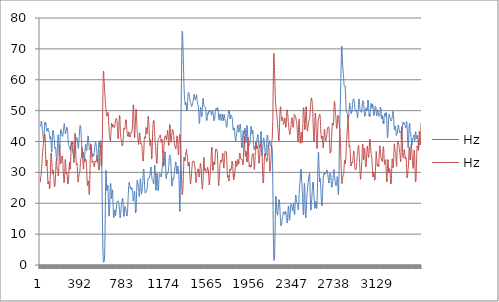
| Category | Hz |
|---|---|
| 0 | 26.726 |
| 1 | 26.86 |
| 2 | 26.973 |
| 3 | 27.096 |
| 4 | 27.419 |
| 5 | 28.13 |
| 6 | 28.596 |
| 7 | 28.884 |
| 8 | 28.81 |
| 9 | 28.945 |
| 10 | 29.17 |
| 11 | 29.409 |
| 12 | 29.923 |
| 13 | 30.649 |
| 14 | 31.294 |
| 15 | 31.779 |
| 16 | 32.388 |
| 17 | 32.934 |
| 18 | 33.452 |
| 19 | 34.033 |
| 20 | 34.539 |
| 21 | 35.131 |
| 22 | 35.586 |
| 23 | 35.89 |
| 24 | 36.439 |
| 25 | 36.863 |
| 26 | 37.154 |
| 27 | 37.618 |
| 28 | 38.208 |
| 29 | 38.745 |
| 30 | 39.246 |
| 31 | 39.546 |
| 32 | 39.827 |
| 33 | 40.127 |
| 34 | 40.131 |
| 35 | 40.396 |
| 36 | 40.659 |
| 37 | 40.978 |
| 38 | 41.489 |
| 39 | 41.693 |
| 40 | 41.989 |
| 41 | 42.309 |
| 42 | 42.433 |
| 43 | 42.374 |
| 44 | 42.374 |
| 45 | 41.998 |
| 46 | 41.648 |
| 47 | 40.816 |
| 48 | 39.41 |
| 49 | 38.141 |
| 50 | 36.687 |
| 51 | 35.324 |
| 52 | 34.186 |
| 53 | 33.439 |
| 54 | 32.881 |
| 55 | 32.45 |
| 56 | 32.124 |
| 57 | 32.035 |
| 58 | 32.374 |
| 59 | 32.67 |
| 60 | 33.204 |
| 61 | 33.623 |
| 62 | 34.053 |
| 63 | 33.773 |
| 64 | 33.114 |
| 65 | 32.573 |
| 66 | 31.843 |
| 67 | 31.12 |
| 68 | 30.223 |
| 69 | 29.652 |
| 70 | 28.812 |
| 71 | 27.872 |
| 72 | 26.683 |
| 73 | 26.303 |
| 74 | 26.542 |
| 75 | 26.656 |
| 76 | 26.778 |
| 77 | 26.931 |
| 78 | 27.144 |
| 79 | 26.948 |
| 80 | 26.988 |
| 81 | 27.107 |
| 82 | 27.435 |
| 83 | 27.185 |
| 84 | 26.3 |
| 85 | 25.553 |
| 86 | 25.038 |
| 87 | 24.706 |
| 88 | 24.585 |
| 89 | 24.774 |
| 90 | 25.021 |
| 91 | 25.634 |
| 92 | 26.244 |
| 93 | 27.337 |
| 94 | 28.798 |
| 95 | 30.245 |
| 96 | 31.531 |
| 97 | 32.603 |
| 98 | 33.458 |
| 99 | 34.274 |
| 100 | 35.116 |
| 101 | 35.774 |
| 102 | 36.233 |
| 103 | 36.265 |
| 104 | 36.003 |
| 105 | 35.39 |
| 106 | 34.74 |
| 107 | 34.113 |
| 108 | 33.656 |
| 109 | 33.146 |
| 110 | 32.312 |
| 111 | 31.125 |
| 112 | 30.136 |
| 113 | 29.552 |
| 114 | 29.35 |
| 115 | 29.716 |
| 116 | 30.046 |
| 117 | 30.265 |
| 118 | 30.3 |
| 119 | 30.207 |
| 120 | 30.302 |
| 121 | 30.759 |
| 122 | 31.043 |
| 123 | 30.764 |
| 124 | 30.25 |
| 125 | 29.393 |
| 126 | 28.677 |
| 127 | 28.101 |
| 128 | 27.506 |
| 129 | 27.049 |
| 130 | 26.568 |
| 131 | 25.835 |
| 132 | 25.325 |
| 133 | 25.215 |
| 134 | 25.113 |
| 135 | 25.087 |
| 136 | 25.152 |
| 137 | 25.287 |
| 138 | 25.667 |
| 139 | 26.186 |
| 140 | 26.782 |
| 141 | 27.686 |
| 142 | 28.439 |
| 143 | 29.193 |
| 144 | 30.053 |
| 145 | 31.112 |
| 146 | 32.042 |
| 147 | 32.972 |
| 148 | 33.541 |
| 149 | 33.718 |
| 150 | 33.797 |
| 151 | 33.542 |
| 152 | 33.46 |
| 153 | 33.346 |
| 154 | 32.982 |
| 155 | 32.408 |
| 156 | 31.926 |
| 157 | 31.409 |
| 158 | 31.155 |
| 159 | 31.035 |
| 160 | 30.986 |
| 161 | 31.044 |
| 162 | 30.817 |
| 163 | 30.577 |
| 164 | 30.608 |
| 165 | 30.492 |
| 166 | 30.026 |
| 167 | 29.431 |
| 168 | 28.829 |
| 169 | 28.701 |
| 170 | 28.859 |
| 171 | 29.471 |
| 172 | 30.519 |
| 173 | 31.481 |
| 174 | 32.308 |
| 175 | 33.356 |
| 176 | 34.632 |
| 177 | 36.066 |
| 178 | 37.513 |
| 179 | 38.52 |
| 180 | 38.9 |
| 181 | 38.52 |
| 182 | 37.704 |
| 183 | 36.964 |
| 184 | 36.3 |
| 185 | 35.524 |
| 186 | 34.917 |
| 187 | 34.322 |
| 188 | 33.58 |
| 189 | 32.845 |
| 190 | 32.558 |
| 191 | 32.624 |
| 192 | 32.756 |
| 193 | 33.013 |
| 194 | 33.146 |
| 195 | 33.456 |
| 196 | 33.703 |
| 197 | 33.847 |
| 198 | 34.203 |
| 199 | 34.502 |
| 200 | 34.578 |
| 201 | 34.758 |
| 202 | 35.337 |
| 203 | 35.526 |
| 204 | 35.582 |
| 205 | 35.574 |
| 206 | 35.465 |
| 207 | 35.2 |
| 208 | 34.431 |
| 209 | 33.868 |
| 210 | 33.32 |
| 211 | 32.532 |
| 212 | 31.357 |
| 213 | 30.485 |
| 214 | 30.068 |
| 215 | 29.491 |
| 216 | 28.742 |
| 217 | 27.977 |
| 218 | 27.65 |
| 219 | 27.181 |
| 220 | 26.711 |
| 221 | 26.588 |
| 222 | 26.724 |
| 223 | 26.919 |
| 224 | 27.116 |
| 225 | 27.473 |
| 226 | 28.191 |
| 227 | 29.311 |
| 228 | 30.414 |
| 229 | 31.517 |
| 230 | 32.751 |
| 231 | 33.635 |
| 232 | 34.148 |
| 233 | 34.183 |
| 234 | 33.73 |
| 235 | 33.256 |
| 236 | 32.684 |
| 237 | 31.974 |
| 238 | 31.32 |
| 239 | 30.727 |
| 240 | 30.079 |
| 241 | 29.542 |
| 242 | 29.235 |
| 243 | 29.578 |
| 244 | 30.052 |
| 245 | 30.232 |
| 246 | 30.262 |
| 247 | 30.051 |
| 248 | 29.587 |
| 249 | 29.15 |
| 250 | 28.819 |
| 251 | 28.594 |
| 252 | 28.195 |
| 253 | 27.425 |
| 254 | 26.845 |
| 255 | 26.57 |
| 256 | 26.239 |
| 257 | 26.181 |
| 258 | 26.428 |
| 259 | 26.692 |
| 260 | 26.881 |
| 261 | 26.906 |
| 262 | 27.268 |
| 263 | 27.856 |
| 264 | 28.528 |
| 265 | 29.323 |
| 266 | 30.444 |
| 267 | 31.454 |
| 268 | 32.041 |
| 269 | 32.507 |
| 270 | 32.756 |
| 271 | 33.262 |
| 272 | 33.404 |
| 273 | 33.368 |
| 274 | 32.961 |
| 275 | 32.249 |
| 276 | 31.442 |
| 277 | 30.978 |
| 278 | 31.229 |
| 279 | 31.705 |
| 280 | 32.495 |
| 281 | 33.013 |
| 282 | 33.854 |
| 283 | 34.66 |
| 284 | 36.101 |
| 285 | 37.775 |
| 286 | 39.198 |
| 287 | 39.997 |
| 288 | 40.122 |
| 289 | 40.026 |
| 290 | 39.879 |
| 291 | 40.032 |
| 292 | 39.998 |
| 293 | 40.29 |
| 294 | 39.913 |
| 295 | 39.504 |
| 296 | 39.176 |
| 297 | 39.206 |
| 298 | 39.51 |
| 299 | 39.735 |
| 300 | 39.84 |
| 301 | 39.682 |
| 302 | 39.37 |
| 303 | 38.564 |
| 304 | 37.961 |
| 305 | 37.143 |
| 306 | 36.606 |
| 307 | 35.774 |
| 308 | 34.866 |
| 309 | 34.233 |
| 310 | 33.721 |
| 311 | 33.221 |
| 312 | 33.236 |
| 313 | 33.752 |
| 314 | 34.527 |
| 315 | 35.554 |
| 316 | 36.382 |
| 317 | 37.625 |
| 318 | 38.931 |
| 319 | 40.064 |
| 320 | 41.002 |
| 321 | 41.995 |
| 322 | 42.595 |
| 323 | 42.714 |
| 324 | 42.305 |
| 325 | 41.678 |
| 326 | 40.735 |
| 327 | 39.486 |
| 328 | 38.117 |
| 329 | 36.882 |
| 330 | 35.846 |
| 331 | 34.807 |
| 332 | 33.829 |
| 333 | 33.07 |
| 334 | 32.76 |
| 335 | 32.51 |
| 336 | 32.665 |
| 337 | 32.987 |
| 338 | 33.215 |
| 339 | 33.185 |
| 340 | 32.868 |
| 341 | 32.564 |
| 342 | 32.158 |
| 343 | 31.633 |
| 344 | 30.792 |
| 345 | 30.02 |
| 346 | 29.321 |
| 347 | 28.475 |
| 348 | 27.863 |
| 349 | 27.328 |
| 350 | 27.076 |
| 351 | 26.875 |
| 352 | 26.846 |
| 353 | 27.023 |
| 354 | 27.496 |
| 355 | 28.08 |
| 356 | 28.422 |
| 357 | 28.747 |
| 358 | 28.92 |
| 359 | 29.275 |
| 360 | 29.434 |
| 361 | 29.494 |
| 362 | 29.54 |
| 363 | 29.635 |
| 364 | 29.75 |
| 365 | 29.752 |
| 366 | 29.915 |
| 367 | 30.399 |
| 368 | 31.11 |
| 369 | 31.642 |
| 370 | 32.369 |
| 371 | 33.166 |
| 372 | 33.708 |
| 373 | 33.953 |
| 374 | 34.024 |
| 375 | 34.118 |
| 376 | 34.434 |
| 377 | 34.554 |
| 378 | 34.48 |
| 379 | 34.534 |
| 380 | 34.676 |
| 381 | 34.887 |
| 382 | 35.551 |
| 383 | 36.444 |
| 384 | 37.336 |
| 385 | 38.043 |
| 386 | 37.947 |
| 387 | 37.695 |
| 388 | 37.649 |
| 389 | 37.899 |
| 390 | 37.738 |
| 391 | 37.149 |
| 392 | 36.068 |
| 393 | 34.875 |
| 394 | 33.709 |
| 395 | 32.77 |
| 396 | 32.52 |
| 397 | 32.487 |
| 398 | 32.24 |
| 399 | 31.411 |
| 400 | 31.019 |
| 401 | 31.179 |
| 402 | 31.765 |
| 403 | 32.394 |
| 404 | 32.977 |
| 405 | 33.364 |
| 406 | 33.48 |
| 407 | 33.515 |
| 408 | 33.696 |
| 409 | 34.066 |
| 410 | 34.21 |
| 411 | 34.126 |
| 412 | 33.796 |
| 413 | 33.616 |
| 414 | 33.582 |
| 415 | 33.732 |
| 416 | 34.014 |
| 417 | 34.269 |
| 418 | 34.278 |
| 419 | 34.367 |
| 420 | 34.434 |
| 421 | 34.496 |
| 422 | 34.686 |
| 423 | 34.505 |
| 424 | 34.189 |
| 425 | 33.722 |
| 426 | 33.003 |
| 427 | 32.224 |
| 428 | 31.652 |
| 429 | 30.91 |
| 430 | 30.141 |
| 431 | 29.276 |
| 432 | 28.353 |
| 433 | 27.543 |
| 434 | 26.767 |
| 435 | 26.22 |
| 436 | 25.905 |
| 437 | 25.686 |
| 438 | 25.393 |
| 439 | 25.448 |
| 440 | 25.866 |
| 441 | 26.454 |
| 442 | 26.811 |
| 443 | 27.111 |
| 444 | 27.244 |
| 445 | 27.211 |
| 446 | 26.992 |
| 447 | 26.568 |
| 448 | 26.15 |
| 449 | 25.549 |
| 450 | 24.438 |
| 451 | 23.411 |
| 452 | 22.868 |
| 453 | 22.816 |
| 454 | 23.099 |
| 455 | 23.273 |
| 456 | 23.969 |
| 457 | 25.459 |
| 458 | 27.227 |
| 459 | 28.918 |
| 460 | 30.884 |
| 461 | 32.782 |
| 462 | 34.362 |
| 463 | 35.641 |
| 464 | 36.752 |
| 465 | 38.226 |
| 466 | 39.266 |
| 467 | 39.527 |
| 468 | 39.335 |
| 469 | 39.306 |
| 470 | 39.151 |
| 471 | 38.612 |
| 472 | 38.162 |
| 473 | 37.688 |
| 474 | 37.195 |
| 475 | 36.302 |
| 476 | 35.36 |
| 477 | 34.567 |
| 478 | 34.265 |
| 479 | 33.675 |
| 480 | 33.172 |
| 481 | 33.079 |
| 482 | 33.09 |
| 483 | 32.995 |
| 484 | 32.959 |
| 485 | 33.012 |
| 486 | 33.274 |
| 487 | 33.63 |
| 488 | 33.567 |
| 489 | 33.761 |
| 490 | 33.819 |
| 491 | 33.668 |
| 492 | 33.208 |
| 493 | 32.858 |
| 494 | 32.601 |
| 495 | 32.534 |
| 496 | 32.308 |
| 497 | 31.999 |
| 498 | 31.845 |
| 499 | 31.594 |
| 500 | 31.571 |
| 501 | 31.778 |
| 502 | 32.211 |
| 503 | 32.766 |
| 504 | 32.995 |
| 505 | 33.149 |
| 506 | 33.424 |
| 507 | 33.728 |
| 508 | 33.825 |
| 509 | 33.892 |
| 510 | 33.942 |
| 511 | 33.816 |
| 512 | 33.641 |
| 513 | 33.298 |
| 514 | 33.215 |
| 515 | 33.16 |
| 516 | 33.326 |
| 517 | 33.462 |
| 518 | 33.657 |
| 519 | 34.048 |
| 520 | 34.195 |
| 521 | 34.475 |
| 522 | 34.704 |
| 523 | 35.017 |
| 524 | 35.277 |
| 525 | 35.433 |
| 526 | 34.957 |
| 527 | 34.471 |
| 528 | 34.351 |
| 529 | 33.929 |
| 530 | 33.822 |
| 531 | 33.559 |
| 532 | 33.357 |
| 533 | 33.049 |
| 534 | 32.721 |
| 535 | 32.356 |
| 536 | 32.269 |
| 537 | 32.323 |
| 538 | 31.875 |
| 539 | 31.561 |
| 540 | 31.146 |
| 541 | 30.929 |
| 542 | 30.738 |
| 543 | 30.702 |
| 544 | 30.863 |
| 545 | 31.222 |
| 546 | 31.976 |
| 547 | 32.594 |
| 548 | 33.757 |
| 549 | 35.069 |
| 550 | 36.336 |
| 551 | 37.422 |
| 552 | 38.342 |
| 553 | 38.841 |
| 554 | 39.074 |
| 555 | 39.085 |
| 556 | 38.604 |
| 557 | 38.123 |
| 558 | 37.324 |
| 559 | 36.086 |
| 560 | 34.664 |
| 561 | 33.346 |
| 562 | 32.396 |
| 563 | 32.13 |
| 564 | 31.952 |
| 565 | 31.778 |
| 566 | 31.853 |
| 567 | 31.974 |
| 568 | 32.168 |
| 569 | 33.161 |
| 570 | 34.88 |
| 571 | 36.778 |
| 572 | 38.656 |
| 573 | 40.356 |
| 574 | 42.447 |
| 575 | 45.19 |
| 576 | 48.116 |
| 577 | 51.218 |
| 578 | 54.234 |
| 579 | 56.8 |
| 580 | 58.505 |
| 581 | 60.014 |
| 582 | 61.243 |
| 583 | 62.277 |
| 584 | 62.804 |
| 585 | 62.704 |
| 586 | 62.144 |
| 587 | 61.353 |
| 588 | 60.71 |
| 589 | 59.927 |
| 590 | 59.467 |
| 591 | 58.887 |
| 592 | 58.296 |
| 593 | 57.547 |
| 594 | 56.76 |
| 595 | 56.027 |
| 596 | 55.652 |
| 597 | 55.294 |
| 598 | 54.676 |
| 599 | 54.114 |
| 600 | 53.422 |
| 601 | 52.778 |
| 602 | 52.099 |
| 603 | 51.646 |
| 604 | 51.593 |
| 605 | 51.489 |
| 606 | 50.94 |
| 607 | 50.266 |
| 608 | 49.911 |
| 609 | 49.504 |
| 610 | 49.272 |
| 611 | 49.1 |
| 612 | 49.144 |
| 613 | 49.282 |
| 614 | 48.989 |
| 615 | 48.557 |
| 616 | 48.215 |
| 617 | 48.277 |
| 618 | 48.324 |
| 619 | 48.577 |
| 620 | 48.81 |
| 621 | 49.005 |
| 622 | 49.089 |
| 623 | 48.854 |
| 624 | 48.714 |
| 625 | 48.927 |
| 626 | 49.459 |
| 627 | 49.463 |
| 628 | 49.032 |
| 629 | 48.445 |
| 630 | 47.656 |
| 631 | 46.821 |
| 632 | 45.986 |
| 633 | 45.349 |
| 634 | 44.817 |
| 635 | 44.013 |
| 636 | 43.218 |
| 637 | 42.696 |
| 638 | 42.279 |
| 639 | 41.934 |
| 640 | 41.681 |
| 641 | 41.516 |
| 642 | 41.305 |
| 643 | 41.018 |
| 644 | 40.735 |
| 645 | 40.652 |
| 646 | 40.345 |
| 647 | 40.197 |
| 648 | 40.416 |
| 649 | 40.62 |
| 650 | 41.14 |
| 651 | 41.662 |
| 652 | 42.23 |
| 653 | 42.918 |
| 654 | 43.691 |
| 655 | 44.274 |
| 656 | 44.942 |
| 657 | 45.477 |
| 658 | 45.93 |
| 659 | 46.206 |
| 660 | 46.15 |
| 661 | 46.06 |
| 662 | 46.053 |
| 663 | 45.975 |
| 664 | 45.619 |
| 665 | 45.268 |
| 666 | 45.192 |
| 667 | 45.011 |
| 668 | 44.681 |
| 669 | 44.78 |
| 670 | 45.076 |
| 671 | 45.375 |
| 672 | 45.42 |
| 673 | 45.32 |
| 674 | 45.258 |
| 675 | 45.578 |
| 676 | 45.499 |
| 677 | 45.532 |
| 678 | 45.662 |
| 679 | 45.328 |
| 680 | 44.832 |
| 681 | 44.445 |
| 682 | 44.225 |
| 683 | 44.203 |
| 684 | 44.528 |
| 685 | 44.577 |
| 686 | 44.686 |
| 687 | 44.777 |
| 688 | 44.814 |
| 689 | 45.209 |
| 690 | 45.629 |
| 691 | 45.854 |
| 692 | 46.287 |
| 693 | 46.714 |
| 694 | 46.84 |
| 695 | 46.982 |
| 696 | 47.035 |
| 697 | 47.031 |
| 698 | 47.142 |
| 699 | 47.122 |
| 700 | 47.127 |
| 701 | 47.484 |
| 702 | 47.446 |
| 703 | 47.152 |
| 704 | 47.016 |
| 705 | 46.829 |
| 706 | 46.873 |
| 707 | 47 |
| 708 | 46.78 |
| 709 | 46.519 |
| 710 | 46.067 |
| 711 | 44.938 |
| 712 | 44.121 |
| 713 | 43.676 |
| 714 | 43.159 |
| 715 | 42.639 |
| 716 | 42.135 |
| 717 | 41.416 |
| 718 | 41.118 |
| 719 | 40.892 |
| 720 | 40.993 |
| 721 | 41.718 |
| 722 | 42.361 |
| 723 | 42.84 |
| 724 | 43.314 |
| 725 | 44.218 |
| 726 | 44.958 |
| 727 | 46.074 |
| 728 | 46.95 |
| 729 | 47.7 |
| 730 | 48.082 |
| 731 | 48.269 |
| 732 | 48.429 |
| 733 | 48.421 |
| 734 | 48.361 |
| 735 | 47.488 |
| 736 | 46.66 |
| 737 | 45.468 |
| 738 | 44.314 |
| 739 | 43.337 |
| 740 | 42.888 |
| 741 | 42.393 |
| 742 | 41.748 |
| 743 | 41.316 |
| 744 | 40.875 |
| 745 | 40.975 |
| 746 | 40.925 |
| 747 | 40.972 |
| 748 | 40.973 |
| 749 | 40.948 |
| 750 | 40.591 |
| 751 | 40.164 |
| 752 | 39.75 |
| 753 | 39.313 |
| 754 | 39.01 |
| 755 | 38.509 |
| 756 | 38.416 |
| 757 | 38.378 |
| 758 | 38.584 |
| 759 | 38.569 |
| 760 | 38.369 |
| 761 | 38.428 |
| 762 | 38.855 |
| 763 | 39.388 |
| 764 | 40.01 |
| 765 | 40.85 |
| 766 | 41.446 |
| 767 | 42.264 |
| 768 | 42.638 |
| 769 | 43.101 |
| 770 | 43.854 |
| 771 | 44.32 |
| 772 | 44.455 |
| 773 | 44.582 |
| 774 | 44.615 |
| 775 | 44.413 |
| 776 | 44.279 |
| 777 | 43.89 |
| 778 | 43.86 |
| 779 | 43.921 |
| 780 | 44.021 |
| 781 | 44.342 |
| 782 | 44.767 |
| 783 | 44.999 |
| 784 | 45.157 |
| 785 | 45.606 |
| 786 | 45.927 |
| 787 | 46.321 |
| 788 | 46.697 |
| 789 | 46.926 |
| 790 | 47.048 |
| 791 | 46.914 |
| 792 | 46.782 |
| 793 | 46.746 |
| 794 | 46.576 |
| 795 | 45.959 |
| 796 | 45.486 |
| 797 | 44.872 |
| 798 | 44.024 |
| 799 | 43.512 |
| 800 | 43.109 |
| 801 | 43.058 |
| 802 | 42.943 |
| 803 | 42.502 |
| 804 | 42.131 |
| 805 | 42.056 |
| 806 | 41.817 |
| 807 | 41.792 |
| 808 | 42.1 |
| 809 | 42.14 |
| 810 | 41.875 |
| 811 | 41.67 |
| 812 | 41.461 |
| 813 | 41.738 |
| 814 | 42.173 |
| 815 | 42.613 |
| 816 | 43.111 |
| 817 | 43.364 |
| 818 | 43.431 |
| 819 | 43.269 |
| 820 | 43.414 |
| 821 | 43.142 |
| 822 | 42.923 |
| 823 | 42.588 |
| 824 | 42.24 |
| 825 | 41.85 |
| 826 | 41.607 |
| 827 | 41.46 |
| 828 | 41.27 |
| 829 | 41.606 |
| 830 | 41.734 |
| 831 | 41.873 |
| 832 | 42.017 |
| 833 | 42.14 |
| 834 | 42.31 |
| 835 | 42.496 |
| 836 | 42.545 |
| 837 | 42.74 |
| 838 | 42.952 |
| 839 | 42.631 |
| 840 | 42.468 |
| 841 | 42.663 |
| 842 | 42.987 |
| 843 | 43.112 |
| 844 | 43.111 |
| 845 | 42.992 |
| 846 | 43.021 |
| 847 | 43.027 |
| 848 | 43.277 |
| 849 | 44.047 |
| 850 | 44.839 |
| 851 | 45.382 |
| 852 | 46.159 |
| 853 | 47.311 |
| 854 | 48.451 |
| 855 | 49.701 |
| 856 | 50.746 |
| 857 | 51.491 |
| 858 | 51.863 |
| 859 | 51.98 |
| 860 | 51.82 |
| 861 | 51.476 |
| 862 | 50.192 |
| 863 | 48.664 |
| 864 | 47.237 |
| 865 | 45.878 |
| 866 | 44.464 |
| 867 | 43.454 |
| 868 | 42.629 |
| 869 | 41.757 |
| 870 | 41.306 |
| 871 | 41.155 |
| 872 | 41.689 |
| 873 | 42.446 |
| 874 | 43.196 |
| 875 | 43.785 |
| 876 | 44.771 |
| 877 | 45.724 |
| 878 | 46.709 |
| 879 | 47.767 |
| 880 | 48.461 |
| 881 | 49.303 |
| 882 | 50.04 |
| 883 | 50.338 |
| 884 | 50.392 |
| 885 | 50.362 |
| 886 | 49.9 |
| 887 | 49.118 |
| 888 | 48.282 |
| 889 | 47.35 |
| 890 | 46.676 |
| 891 | 45.772 |
| 892 | 44.911 |
| 893 | 44.135 |
| 894 | 43.487 |
| 895 | 43.061 |
| 896 | 42.835 |
| 897 | 42.655 |
| 898 | 42.27 |
| 899 | 41.936 |
| 900 | 41.505 |
| 901 | 41.069 |
| 902 | 40.418 |
| 903 | 40.031 |
| 904 | 39.691 |
| 905 | 39.388 |
| 906 | 39.052 |
| 907 | 39.012 |
| 908 | 39.356 |
| 909 | 39.776 |
| 910 | 40.085 |
| 911 | 40.486 |
| 912 | 41.197 |
| 913 | 41.724 |
| 914 | 42.21 |
| 915 | 42.517 |
| 916 | 42.797 |
| 917 | 42.8 |
| 918 | 42.456 |
| 919 | 42.145 |
| 920 | 41.964 |
| 921 | 41.44 |
| 922 | 40.722 |
| 923 | 40.224 |
| 924 | 39.95 |
| 925 | 39.71 |
| 926 | 39.399 |
| 927 | 39.146 |
| 928 | 39.159 |
| 929 | 39.167 |
| 930 | 39.133 |
| 931 | 39.471 |
| 932 | 39.705 |
| 933 | 39.563 |
| 934 | 39.212 |
| 935 | 38.958 |
| 936 | 38.863 |
| 937 | 38.758 |
| 938 | 38.567 |
| 939 | 38.092 |
| 940 | 37.433 |
| 941 | 36.71 |
| 942 | 36.074 |
| 943 | 35.777 |
| 944 | 35.472 |
| 945 | 35.141 |
| 946 | 34.666 |
| 947 | 34.181 |
| 948 | 33.67 |
| 949 | 33.521 |
| 950 | 33.757 |
| 951 | 34.132 |
| 952 | 34.844 |
| 953 | 35.435 |
| 954 | 35.996 |
| 955 | 36.614 |
| 956 | 37.497 |
| 957 | 38.558 |
| 958 | 39.72 |
| 959 | 40.599 |
| 960 | 41.19 |
| 961 | 41.405 |
| 962 | 41.291 |
| 963 | 41.273 |
| 964 | 41.44 |
| 965 | 41.558 |
| 966 | 41.408 |
| 967 | 41.236 |
| 968 | 41.071 |
| 969 | 41.193 |
| 970 | 41.406 |
| 971 | 41.929 |
| 972 | 42.519 |
| 973 | 43.181 |
| 974 | 43.705 |
| 975 | 44.041 |
| 976 | 44.493 |
| 977 | 44.669 |
| 978 | 44.592 |
| 979 | 44.302 |
| 980 | 44.113 |
| 981 | 43.777 |
| 982 | 43.438 |
| 983 | 42.931 |
| 984 | 42.531 |
| 985 | 42.402 |
| 986 | 42.409 |
| 987 | 42.868 |
| 988 | 43.663 |
| 989 | 44.424 |
| 990 | 45.061 |
| 991 | 45.747 |
| 992 | 46.405 |
| 993 | 47.061 |
| 994 | 47.617 |
| 995 | 48.084 |
| 996 | 48.332 |
| 997 | 48.174 |
| 998 | 47.607 |
| 999 | 47.128 |
| 1000 | 46.673 |
| 1001 | 46.155 |
| 1002 | 45.507 |
| 1003 | 44.815 |
| 1004 | 43.894 |
| 1005 | 42.796 |
| 1006 | 41.708 |
| 1007 | 40.738 |
| 1008 | 40.163 |
| 1009 | 39.587 |
| 1010 | 39.085 |
| 1011 | 38.814 |
| 1012 | 38.709 |
| 1013 | 38.69 |
| 1014 | 39.056 |
| 1015 | 39.654 |
| 1016 | 40.202 |
| 1017 | 40.56 |
| 1018 | 40.615 |
| 1019 | 40.738 |
| 1020 | 40.481 |
| 1021 | 39.705 |
| 1022 | 38.917 |
| 1023 | 38.081 |
| 1024 | 37.005 |
| 1025 | 35.785 |
| 1026 | 34.851 |
| 1027 | 34.423 |
| 1028 | 34.397 |
| 1029 | 34.436 |
| 1030 | 34.941 |
| 1031 | 35.939 |
| 1032 | 37.101 |
| 1033 | 38.256 |
| 1034 | 39.661 |
| 1035 | 41.164 |
| 1036 | 42.456 |
| 1037 | 43.483 |
| 1038 | 44.198 |
| 1039 | 44.751 |
| 1040 | 45.372 |
| 1041 | 45.911 |
| 1042 | 46.187 |
| 1043 | 46.449 |
| 1044 | 46.554 |
| 1045 | 46.626 |
| 1046 | 46.789 |
| 1047 | 46.738 |
| 1048 | 46.682 |
| 1049 | 46.579 |
| 1050 | 46.015 |
| 1051 | 45.279 |
| 1052 | 44.513 |
| 1053 | 43.912 |
| 1054 | 43.392 |
| 1055 | 42.927 |
| 1056 | 42.151 |
| 1057 | 41.639 |
| 1058 | 40.959 |
| 1059 | 40.193 |
| 1060 | 39.666 |
| 1061 | 39.359 |
| 1062 | 39.166 |
| 1063 | 38.883 |
| 1064 | 38.339 |
| 1065 | 37.543 |
| 1066 | 36.922 |
| 1067 | 36.088 |
| 1068 | 35.622 |
| 1069 | 35.221 |
| 1070 | 34.795 |
| 1071 | 34.086 |
| 1072 | 33.479 |
| 1073 | 32.855 |
| 1074 | 32.632 |
| 1075 | 32.699 |
| 1076 | 33.112 |
| 1077 | 33.749 |
| 1078 | 34.369 |
| 1079 | 35.258 |
| 1080 | 36.016 |
| 1081 | 37.199 |
| 1082 | 38.31 |
| 1083 | 39.291 |
| 1084 | 39.708 |
| 1085 | 40.125 |
| 1086 | 40.353 |
| 1087 | 40.588 |
| 1088 | 40.684 |
| 1089 | 40.598 |
| 1090 | 40.818 |
| 1091 | 40.722 |
| 1092 | 40.584 |
| 1093 | 40.472 |
| 1094 | 40.951 |
| 1095 | 41.295 |
| 1096 | 41.426 |
| 1097 | 41.387 |
| 1098 | 41.441 |
| 1099 | 41.533 |
| 1100 | 41.411 |
| 1101 | 41.366 |
| 1102 | 41.464 |
| 1103 | 41.733 |
| 1104 | 41.732 |
| 1105 | 41.801 |
| 1106 | 42 |
| 1107 | 42.129 |
| 1108 | 41.88 |
| 1109 | 41.59 |
| 1110 | 41.394 |
| 1111 | 41.226 |
| 1112 | 40.893 |
| 1113 | 40.388 |
| 1114 | 40.05 |
| 1115 | 39.72 |
| 1116 | 39.449 |
| 1117 | 39.509 |
| 1118 | 39.948 |
| 1119 | 40.406 |
| 1120 | 40.745 |
| 1121 | 40.786 |
| 1122 | 40.657 |
| 1123 | 40.584 |
| 1124 | 40.223 |
| 1125 | 39.534 |
| 1126 | 38.576 |
| 1127 | 37.345 |
| 1128 | 36.086 |
| 1129 | 34.812 |
| 1130 | 33.696 |
| 1131 | 32.975 |
| 1132 | 32.666 |
| 1133 | 32.443 |
| 1134 | 32.381 |
| 1135 | 32.86 |
| 1136 | 33.85 |
| 1137 | 34.821 |
| 1138 | 35.854 |
| 1139 | 36.988 |
| 1140 | 37.99 |
| 1141 | 38.877 |
| 1142 | 39.45 |
| 1143 | 39.963 |
| 1144 | 40.571 |
| 1145 | 41.057 |
| 1146 | 41.09 |
| 1147 | 41.357 |
| 1148 | 41.426 |
| 1149 | 41.348 |
| 1150 | 41.412 |
| 1151 | 41.416 |
| 1152 | 41.596 |
| 1153 | 41.887 |
| 1154 | 41.861 |
| 1155 | 41.593 |
| 1156 | 41.329 |
| 1157 | 41.103 |
| 1158 | 41.136 |
| 1159 | 41.189 |
| 1160 | 41.166 |
| 1161 | 41.082 |
| 1162 | 40.824 |
| 1163 | 40.463 |
| 1164 | 40.517 |
| 1165 | 40.813 |
| 1166 | 41.468 |
| 1167 | 41.762 |
| 1168 | 41.764 |
| 1169 | 41.929 |
| 1170 | 42.153 |
| 1171 | 42.57 |
| 1172 | 43.17 |
| 1173 | 43.555 |
| 1174 | 43.569 |
| 1175 | 43.314 |
| 1176 | 42.77 |
| 1177 | 42.373 |
| 1178 | 42.13 |
| 1179 | 41.57 |
| 1180 | 40.779 |
| 1181 | 39.951 |
| 1182 | 39.114 |
| 1183 | 38.802 |
| 1184 | 38.745 |
| 1185 | 38.922 |
| 1186 | 39.374 |
| 1187 | 39.96 |
| 1188 | 40.638 |
| 1189 | 41.692 |
| 1190 | 43.002 |
| 1191 | 44.1 |
| 1192 | 45.107 |
| 1193 | 45.476 |
| 1194 | 45.669 |
| 1195 | 45.785 |
| 1196 | 45.455 |
| 1197 | 45.13 |
| 1198 | 44.684 |
| 1199 | 43.841 |
| 1200 | 42.8 |
| 1201 | 41.798 |
| 1202 | 40.804 |
| 1203 | 40.367 |
| 1204 | 40.046 |
| 1205 | 39.703 |
| 1206 | 39.699 |
| 1207 | 39.588 |
| 1208 | 39.411 |
| 1209 | 39.62 |
| 1210 | 40.049 |
| 1211 | 40.776 |
| 1212 | 41.511 |
| 1213 | 42.029 |
| 1214 | 42.597 |
| 1215 | 43.059 |
| 1216 | 43.258 |
| 1217 | 43.466 |
| 1218 | 43.774 |
| 1219 | 43.865 |
| 1220 | 43.854 |
| 1221 | 43.738 |
| 1222 | 43.714 |
| 1223 | 43.644 |
| 1224 | 43.32 |
| 1225 | 43.106 |
| 1226 | 43.144 |
| 1227 | 43.061 |
| 1228 | 42.868 |
| 1229 | 42.635 |
| 1230 | 42.369 |
| 1231 | 41.843 |
| 1232 | 41.252 |
| 1233 | 40.626 |
| 1234 | 40.3 |
| 1235 | 39.882 |
| 1236 | 39.393 |
| 1237 | 39.142 |
| 1238 | 38.996 |
| 1239 | 38.882 |
| 1240 | 38.539 |
| 1241 | 38.483 |
| 1242 | 38.459 |
| 1243 | 38.455 |
| 1244 | 38.303 |
| 1245 | 38.294 |
| 1246 | 38.289 |
| 1247 | 38.017 |
| 1248 | 37.605 |
| 1249 | 37.404 |
| 1250 | 37.773 |
| 1251 | 38.059 |
| 1252 | 38.259 |
| 1253 | 38.597 |
| 1254 | 39.039 |
| 1255 | 39.434 |
| 1256 | 39.853 |
| 1257 | 40.556 |
| 1258 | 41.314 |
| 1259 | 41.866 |
| 1260 | 42.008 |
| 1261 | 41.986 |
| 1262 | 42.059 |
| 1263 | 42.102 |
| 1264 | 41.932 |
| 1265 | 41.494 |
| 1266 | 40.733 |
| 1267 | 39.812 |
| 1268 | 38.946 |
| 1269 | 38.09 |
| 1270 | 37.344 |
| 1271 | 36.891 |
| 1272 | 36.288 |
| 1273 | 35.705 |
| 1274 | 35.479 |
| 1275 | 35.663 |
| 1276 | 36.382 |
| 1277 | 37.065 |
| 1278 | 37.825 |
| 1279 | 38.669 |
| 1280 | 39.375 |
| 1281 | 39.891 |
| 1282 | 40.706 |
| 1283 | 41.483 |
| 1284 | 41.926 |
| 1285 | 42.27 |
| 1286 | 42.351 |
| 1287 | 42.452 |
| 1288 | 42.429 |
| 1289 | 42.316 |
| 1290 | 42.198 |
| 1291 | 41.749 |
| 1292 | 40.86 |
| 1293 | 39.853 |
| 1294 | 38.982 |
| 1295 | 37.933 |
| 1296 | 36.671 |
| 1297 | 35.407 |
| 1298 | 34.062 |
| 1299 | 32.516 |
| 1300 | 30.992 |
| 1301 | 29.71 |
| 1302 | 28.616 |
| 1303 | 27.529 |
| 1304 | 26.305 |
| 1305 | 25.192 |
| 1306 | 24.263 |
| 1307 | 23.417 |
| 1308 | 22.828 |
| 1309 | 22.786 |
| 1310 | 22.848 |
| 1311 | 23.249 |
| 1312 | 23.556 |
| 1313 | 23.742 |
| 1314 | 24.172 |
| 1315 | 24.896 |
| 1316 | 26.053 |
| 1317 | 27.22 |
| 1318 | 28.144 |
| 1319 | 28.75 |
| 1320 | 29.789 |
| 1321 | 30.745 |
| 1322 | 31.842 |
| 1323 | 33.247 |
| 1324 | 34.348 |
| 1325 | 34.928 |
| 1326 | 34.929 |
| 1327 | 34.746 |
| 1328 | 34.961 |
| 1329 | 35.17 |
| 1330 | 34.92 |
| 1331 | 34.316 |
| 1332 | 34.089 |
| 1333 | 33.768 |
| 1334 | 33.735 |
| 1335 | 33.977 |
| 1336 | 34.351 |
| 1337 | 34.762 |
| 1338 | 34.646 |
| 1339 | 35.133 |
| 1340 | 35.594 |
| 1341 | 36.404 |
| 1342 | 36.56 |
| 1343 | 36.584 |
| 1344 | 36.464 |
| 1345 | 36.318 |
| 1346 | 36.424 |
| 1347 | 36.835 |
| 1348 | 37.576 |
| 1349 | 37.187 |
| 1350 | 36.568 |
| 1351 | 36.03 |
| 1352 | 35.881 |
| 1353 | 35.963 |
| 1354 | 35.935 |
| 1355 | 35.865 |
| 1356 | 35.354 |
| 1357 | 34.723 |
| 1358 | 33.917 |
| 1359 | 33.62 |
| 1360 | 33.609 |
| 1361 | 33.125 |
| 1362 | 32.596 |
| 1363 | 32.083 |
| 1364 | 32.048 |
| 1365 | 32.193 |
| 1366 | 32.673 |
| 1367 | 32.867 |
| 1368 | 33.009 |
| 1369 | 33.133 |
| 1370 | 33.064 |
| 1371 | 33.362 |
| 1372 | 33.547 |
| 1373 | 33.53 |
| 1374 | 33.017 |
| 1375 | 32.047 |
| 1376 | 30.794 |
| 1377 | 29.89 |
| 1378 | 29.249 |
| 1379 | 28.653 |
| 1380 | 28.221 |
| 1381 | 27.641 |
| 1382 | 27.211 |
| 1383 | 26.715 |
| 1384 | 26.211 |
| 1385 | 26.156 |
| 1386 | 26.499 |
| 1387 | 26.801 |
| 1388 | 27.1 |
| 1389 | 27.402 |
| 1390 | 27.679 |
| 1391 | 28.106 |
| 1392 | 28.364 |
| 1393 | 28.839 |
| 1394 | 29.604 |
| 1395 | 30.252 |
| 1396 | 30.773 |
| 1397 | 31.204 |
| 1398 | 31.445 |
| 1399 | 31.799 |
| 1400 | 32.497 |
| 1401 | 32.956 |
| 1402 | 33.326 |
| 1403 | 33.448 |
| 1404 | 33.419 |
| 1405 | 33.517 |
| 1406 | 33.609 |
| 1407 | 33.654 |
| 1408 | 33.755 |
| 1409 | 33.95 |
| 1410 | 33.81 |
| 1411 | 33.672 |
| 1412 | 33.54 |
| 1413 | 33.682 |
| 1414 | 33.844 |
| 1415 | 33.804 |
| 1416 | 33.663 |
| 1417 | 33.626 |
| 1418 | 33.604 |
| 1419 | 33.076 |
| 1420 | 32.472 |
| 1421 | 32.184 |
| 1422 | 32.324 |
| 1423 | 32.307 |
| 1424 | 32.202 |
| 1425 | 32.071 |
| 1426 | 31.869 |
| 1427 | 31.422 |
| 1428 | 30.72 |
| 1429 | 30.27 |
| 1430 | 29.967 |
| 1431 | 29.451 |
| 1432 | 28.697 |
| 1433 | 28.025 |
| 1434 | 27.498 |
| 1435 | 27.121 |
| 1436 | 26.758 |
| 1437 | 26.643 |
| 1438 | 26.982 |
| 1439 | 27.427 |
| 1440 | 27.794 |
| 1441 | 28.281 |
| 1442 | 28.721 |
| 1443 | 29.066 |
| 1444 | 29.421 |
| 1445 | 29.674 |
| 1446 | 30.011 |
| 1447 | 30.299 |
| 1448 | 30.346 |
| 1449 | 30.443 |
| 1450 | 30.741 |
| 1451 | 30.953 |
| 1452 | 31.148 |
| 1453 | 31.347 |
| 1454 | 31.304 |
| 1455 | 31.192 |
| 1456 | 31.139 |
| 1457 | 30.934 |
| 1458 | 30.799 |
| 1459 | 30.596 |
| 1460 | 30.044 |
| 1461 | 29.436 |
| 1462 | 28.912 |
| 1463 | 28.513 |
| 1464 | 28.258 |
| 1465 | 28.511 |
| 1466 | 28.599 |
| 1467 | 28.931 |
| 1468 | 29.311 |
| 1469 | 29.723 |
| 1470 | 30.38 |
| 1471 | 30.972 |
| 1472 | 31.329 |
| 1473 | 31.692 |
| 1474 | 32.373 |
| 1475 | 32.525 |
| 1476 | 32.877 |
| 1477 | 33.071 |
| 1478 | 32.887 |
| 1479 | 32.32 |
| 1480 | 31.778 |
| 1481 | 31.487 |
| 1482 | 31.39 |
| 1483 | 30.947 |
| 1484 | 30.078 |
| 1485 | 29.127 |
| 1486 | 28.116 |
| 1487 | 27.166 |
| 1488 | 26.643 |
| 1489 | 26.535 |
| 1490 | 26.353 |
| 1491 | 25.807 |
| 1492 | 25.015 |
| 1493 | 24.65 |
| 1494 | 24.607 |
| 1495 | 24.951 |
| 1496 | 25.282 |
| 1497 | 25.766 |
| 1498 | 26.246 |
| 1499 | 26.787 |
| 1500 | 27.334 |
| 1501 | 28.431 |
| 1502 | 30.145 |
| 1503 | 31.775 |
| 1504 | 32.878 |
| 1505 | 33.744 |
| 1506 | 34.462 |
| 1507 | 34.82 |
| 1508 | 34.796 |
| 1509 | 34.559 |
| 1510 | 34.414 |
| 1511 | 33.86 |
| 1512 | 32.906 |
| 1513 | 31.914 |
| 1514 | 31.44 |
| 1515 | 30.942 |
| 1516 | 30.546 |
| 1517 | 30.532 |
| 1518 | 30.918 |
| 1519 | 31.212 |
| 1520 | 31.279 |
| 1521 | 31.394 |
| 1522 | 31.439 |
| 1523 | 31.304 |
| 1524 | 31.109 |
| 1525 | 31.063 |
| 1526 | 31.058 |
| 1527 | 30.668 |
| 1528 | 30.207 |
| 1529 | 30.035 |
| 1530 | 29.8 |
| 1531 | 29.677 |
| 1532 | 29.642 |
| 1533 | 30.032 |
| 1534 | 30.234 |
| 1535 | 30.343 |
| 1536 | 30.428 |
| 1537 | 30.619 |
| 1538 | 30.763 |
| 1539 | 30.713 |
| 1540 | 31.084 |
| 1541 | 31.366 |
| 1542 | 31.63 |
| 1543 | 31.458 |
| 1544 | 31.288 |
| 1545 | 31.14 |
| 1546 | 31.15 |
| 1547 | 31.313 |
| 1548 | 31.239 |
| 1549 | 31.086 |
| 1550 | 30.491 |
| 1551 | 29.848 |
| 1552 | 29.1 |
| 1553 | 28.436 |
| 1554 | 27.627 |
| 1555 | 27 |
| 1556 | 26.52 |
| 1557 | 25.972 |
| 1558 | 25.686 |
| 1559 | 25.666 |
| 1560 | 26.076 |
| 1561 | 26.573 |
| 1562 | 27.156 |
| 1563 | 27.784 |
| 1564 | 28.785 |
| 1565 | 29.462 |
| 1566 | 29.769 |
| 1567 | 30.255 |
| 1568 | 30.882 |
| 1569 | 31.408 |
| 1570 | 31.549 |
| 1571 | 31.624 |
| 1572 | 32.03 |
| 1573 | 32.886 |
| 1574 | 33.815 |
| 1575 | 34.986 |
| 1576 | 35.971 |
| 1577 | 36.625 |
| 1578 | 37.007 |
| 1579 | 37.285 |
| 1580 | 37.669 |
| 1581 | 38.099 |
| 1582 | 38.04 |
| 1583 | 37.176 |
| 1584 | 36.026 |
| 1585 | 34.673 |
| 1586 | 33.669 |
| 1587 | 32.892 |
| 1588 | 32.193 |
| 1589 | 31.525 |
| 1590 | 31.071 |
| 1591 | 30.609 |
| 1592 | 30.494 |
| 1593 | 30.917 |
| 1594 | 31.275 |
| 1595 | 31.835 |
| 1596 | 32.326 |
| 1597 | 32.653 |
| 1598 | 32.994 |
| 1599 | 33.36 |
| 1600 | 33.445 |
| 1601 | 33.36 |
| 1602 | 33.113 |
| 1603 | 32.831 |
| 1604 | 32.768 |
| 1605 | 32.506 |
| 1606 | 32.381 |
| 1607 | 32.495 |
| 1608 | 32.715 |
| 1609 | 33.068 |
| 1610 | 33.703 |
| 1611 | 34.583 |
| 1612 | 35.314 |
| 1613 | 35.868 |
| 1614 | 36.281 |
| 1615 | 37.062 |
| 1616 | 37.515 |
| 1617 | 37.738 |
| 1618 | 37.772 |
| 1619 | 37.538 |
| 1620 | 37.296 |
| 1621 | 37.155 |
| 1622 | 37.243 |
| 1623 | 37.369 |
| 1624 | 37.564 |
| 1625 | 37.38 |
| 1626 | 37.245 |
| 1627 | 37.205 |
| 1628 | 37.185 |
| 1629 | 37.324 |
| 1630 | 37.122 |
| 1631 | 36.761 |
| 1632 | 36.112 |
| 1633 | 35.394 |
| 1634 | 34.484 |
| 1635 | 33.42 |
| 1636 | 32.33 |
| 1637 | 31.176 |
| 1638 | 30.142 |
| 1639 | 29.088 |
| 1640 | 28.287 |
| 1641 | 27.335 |
| 1642 | 26.715 |
| 1643 | 26.125 |
| 1644 | 25.753 |
| 1645 | 25.827 |
| 1646 | 26.257 |
| 1647 | 26.871 |
| 1648 | 27.428 |
| 1649 | 27.968 |
| 1650 | 28.357 |
| 1651 | 28.955 |
| 1652 | 29.543 |
| 1653 | 30.336 |
| 1654 | 31.141 |
| 1655 | 31.761 |
| 1656 | 32.209 |
| 1657 | 32.525 |
| 1658 | 32.877 |
| 1659 | 33.326 |
| 1660 | 33.662 |
| 1661 | 33.99 |
| 1662 | 34.261 |
| 1663 | 34.225 |
| 1664 | 34.2 |
| 1665 | 34.195 |
| 1666 | 34.133 |
| 1667 | 33.957 |
| 1668 | 33.648 |
| 1669 | 33.284 |
| 1670 | 33.319 |
| 1671 | 33.296 |
| 1672 | 33.373 |
| 1673 | 33.83 |
| 1674 | 34.113 |
| 1675 | 34.41 |
| 1676 | 34.716 |
| 1677 | 35.121 |
| 1678 | 35.498 |
| 1679 | 35.9 |
| 1680 | 36.096 |
| 1681 | 36.241 |
| 1682 | 36.013 |
| 1683 | 35.281 |
| 1684 | 34.686 |
| 1685 | 33.984 |
| 1686 | 33.273 |
| 1687 | 32.754 |
| 1688 | 32.436 |
| 1689 | 32.046 |
| 1690 | 31.768 |
| 1691 | 31.476 |
| 1692 | 31.435 |
| 1693 | 31.877 |
| 1694 | 32.254 |
| 1695 | 32.835 |
| 1696 | 33.597 |
| 1697 | 34.08 |
| 1698 | 34.544 |
| 1699 | 35.003 |
| 1700 | 35.337 |
| 1701 | 35.816 |
| 1702 | 36.291 |
| 1703 | 36.545 |
| 1704 | 36.862 |
| 1705 | 37.055 |
| 1706 | 36.952 |
| 1707 | 36.946 |
| 1708 | 36.893 |
| 1709 | 36.923 |
| 1710 | 36.982 |
| 1711 | 37.021 |
| 1712 | 36.993 |
| 1713 | 36.802 |
| 1714 | 36.667 |
| 1715 | 36.456 |
| 1716 | 36.21 |
| 1717 | 35.659 |
| 1718 | 34.846 |
| 1719 | 33.852 |
| 1720 | 33.041 |
| 1721 | 32.161 |
| 1722 | 31.24 |
| 1723 | 30.622 |
| 1724 | 29.741 |
| 1725 | 28.971 |
| 1726 | 28.431 |
| 1727 | 28.355 |
| 1728 | 28.551 |
| 1729 | 29.002 |
| 1730 | 28.769 |
| 1731 | 28.496 |
| 1732 | 28.446 |
| 1733 | 28.287 |
| 1734 | 28.246 |
| 1735 | 28.187 |
| 1736 | 28.061 |
| 1737 | 27.723 |
| 1738 | 27.487 |
| 1739 | 27.26 |
| 1740 | 27.83 |
| 1741 | 28.368 |
| 1742 | 28.554 |
| 1743 | 28.825 |
| 1744 | 29.241 |
| 1745 | 29.626 |
| 1746 | 29.931 |
| 1747 | 30.575 |
| 1748 | 31.124 |
| 1749 | 31.328 |
| 1750 | 30.907 |
| 1751 | 30.544 |
| 1752 | 30.657 |
| 1753 | 30.595 |
| 1754 | 30.49 |
| 1755 | 30.453 |
| 1756 | 30.652 |
| 1757 | 30.465 |
| 1758 | 30.266 |
| 1759 | 30.355 |
| 1760 | 30.994 |
| 1761 | 31.701 |
| 1762 | 31.925 |
| 1763 | 32.257 |
| 1764 | 32.639 |
| 1765 | 32.972 |
| 1766 | 33.202 |
| 1767 | 33.576 |
| 1768 | 33.874 |
| 1769 | 33.857 |
| 1770 | 33.378 |
| 1771 | 33.081 |
| 1772 | 33.047 |
| 1773 | 32.697 |
| 1774 | 31.983 |
| 1775 | 31.182 |
| 1776 | 30.215 |
| 1777 | 29.293 |
| 1778 | 28.568 |
| 1779 | 28.4 |
| 1780 | 28.63 |
| 1781 | 28.206 |
| 1782 | 27.603 |
| 1783 | 27.573 |
| 1784 | 27.928 |
| 1785 | 28.482 |
| 1786 | 29.139 |
| 1787 | 29.514 |
| 1788 | 29.59 |
| 1789 | 29.039 |
| 1790 | 28.647 |
| 1791 | 28.984 |
| 1792 | 29.669 |
| 1793 | 30.118 |
| 1794 | 30.484 |
| 1795 | 30.772 |
| 1796 | 31.149 |
| 1797 | 31.745 |
| 1798 | 32.275 |
| 1799 | 33.215 |
| 1800 | 33.715 |
| 1801 | 33.943 |
| 1802 | 33.93 |
| 1803 | 33.813 |
| 1804 | 33.555 |
| 1805 | 33.012 |
| 1806 | 32.46 |
| 1807 | 31.897 |
| 1808 | 31.93 |
| 1809 | 32.029 |
| 1810 | 32.11 |
| 1811 | 32.031 |
| 1812 | 31.987 |
| 1813 | 31.992 |
| 1814 | 32.224 |
| 1815 | 32.96 |
| 1816 | 33.688 |
| 1817 | 34.211 |
| 1818 | 34.19 |
| 1819 | 34.141 |
| 1820 | 34.084 |
| 1821 | 34.119 |
| 1822 | 34.03 |
| 1823 | 33.884 |
| 1824 | 33.702 |
| 1825 | 33.245 |
| 1826 | 32.645 |
| 1827 | 32.518 |
| 1828 | 32.714 |
| 1829 | 32.665 |
| 1830 | 32.959 |
| 1831 | 33.36 |
| 1832 | 33.825 |
| 1833 | 34.428 |
| 1834 | 34.913 |
| 1835 | 35.362 |
| 1836 | 35.868 |
| 1837 | 36.111 |
| 1838 | 36.114 |
| 1839 | 36.196 |
| 1840 | 36.054 |
| 1841 | 35.756 |
| 1842 | 35.608 |
| 1843 | 35.332 |
| 1844 | 34.994 |
| 1845 | 34.854 |
| 1846 | 34.799 |
| 1847 | 34.644 |
| 1848 | 34.572 |
| 1849 | 34.419 |
| 1850 | 34.204 |
| 1851 | 34.182 |
| 1852 | 34.006 |
| 1853 | 33.967 |
| 1854 | 34.163 |
| 1855 | 34.198 |
| 1856 | 34.075 |
| 1857 | 34.061 |
| 1858 | 34.054 |
| 1859 | 34.088 |
| 1860 | 34.111 |
| 1861 | 33.983 |
| 1862 | 33.96 |
| 1863 | 33.776 |
| 1864 | 33.394 |
| 1865 | 32.844 |
| 1866 | 32.469 |
| 1867 | 32.34 |
| 1868 | 32.274 |
| 1869 | 32.398 |
| 1870 | 32.861 |
| 1871 | 33.671 |
| 1872 | 34.856 |
| 1873 | 36.221 |
| 1874 | 37.437 |
| 1875 | 38.825 |
| 1876 | 40.024 |
| 1877 | 40.74 |
| 1878 | 41.372 |
| 1879 | 41.867 |
| 1880 | 42.011 |
| 1881 | 41.67 |
| 1882 | 40.496 |
| 1883 | 39.143 |
| 1884 | 38.136 |
| 1885 | 37.342 |
| 1886 | 36.828 |
| 1887 | 36.474 |
| 1888 | 35.997 |
| 1889 | 35.605 |
| 1890 | 35.311 |
| 1891 | 35.215 |
| 1892 | 35.684 |
| 1893 | 36.348 |
| 1894 | 36.838 |
| 1895 | 37.029 |
| 1896 | 36.84 |
| 1897 | 36.593 |
| 1898 | 36.468 |
| 1899 | 36.177 |
| 1900 | 35.874 |
| 1901 | 35.408 |
| 1902 | 34.667 |
| 1903 | 33.889 |
| 1904 | 33.342 |
| 1905 | 33.247 |
| 1906 | 33.579 |
| 1907 | 34.459 |
| 1908 | 35.582 |
| 1909 | 36.853 |
| 1910 | 37.916 |
| 1911 | 39.118 |
| 1912 | 40.257 |
| 1913 | 41.009 |
| 1914 | 41.437 |
| 1915 | 41.241 |
| 1916 | 40.922 |
| 1917 | 39.764 |
| 1918 | 38.351 |
| 1919 | 36.766 |
| 1920 | 35.599 |
| 1921 | 34.493 |
| 1922 | 33.582 |
| 1923 | 33.045 |
| 1924 | 32.519 |
| 1925 | 32.279 |
| 1926 | 31.841 |
| 1927 | 31.956 |
| 1928 | 32.097 |
| 1929 | 32.504 |
| 1930 | 32.624 |
| 1931 | 32.516 |
| 1932 | 32.417 |
| 1933 | 32.294 |
| 1934 | 32.332 |
| 1935 | 32.281 |
| 1936 | 32.311 |
| 1937 | 32.173 |
| 1938 | 31.985 |
| 1939 | 31.595 |
| 1940 | 31.293 |
| 1941 | 31.358 |
| 1942 | 31.497 |
| 1943 | 31.719 |
| 1944 | 31.922 |
| 1945 | 32.38 |
| 1946 | 32.971 |
| 1947 | 33.405 |
| 1948 | 33.876 |
| 1949 | 34.29 |
| 1950 | 34.822 |
| 1951 | 35.193 |
| 1952 | 35.505 |
| 1953 | 35.694 |
| 1954 | 35.932 |
| 1955 | 35.994 |
| 1956 | 35.68 |
| 1957 | 35.704 |
| 1958 | 35.73 |
| 1959 | 35.976 |
| 1960 | 36.13 |
| 1961 | 36.184 |
| 1962 | 36.074 |
| 1963 | 35.618 |
| 1964 | 35.147 |
| 1965 | 34.564 |
| 1966 | 34.229 |
| 1967 | 33.73 |
| 1968 | 33.245 |
| 1969 | 32.735 |
| 1970 | 32.125 |
| 1971 | 31.409 |
| 1972 | 30.978 |
| 1973 | 31.222 |
| 1974 | 31.359 |
| 1975 | 31.766 |
| 1976 | 32.504 |
| 1977 | 33.25 |
| 1978 | 33.876 |
| 1979 | 34.418 |
| 1980 | 35.364 |
| 1981 | 36.724 |
| 1982 | 37.781 |
| 1983 | 38.647 |
| 1984 | 39.434 |
| 1985 | 39.814 |
| 1986 | 39.748 |
| 1987 | 39.59 |
| 1988 | 39.791 |
| 1989 | 39.994 |
| 1990 | 39.698 |
| 1991 | 39.065 |
| 1992 | 38.695 |
| 1993 | 38.013 |
| 1994 | 37.589 |
| 1995 | 37.645 |
| 1996 | 37.855 |
| 1997 | 38.146 |
| 1998 | 38.1 |
| 1999 | 38.147 |
| 2000 | 38.201 |
| 2001 | 38.442 |
| 2002 | 38.453 |
| 2003 | 38.659 |
| 2004 | 38.654 |
| 2005 | 38.403 |
| 2006 | 37.988 |
| 2007 | 37.375 |
| 2008 | 36.953 |
| 2009 | 36.115 |
| 2010 | 35.519 |
| 2011 | 34.925 |
| 2012 | 34.615 |
| 2013 | 34.128 |
| 2014 | 33.621 |
| 2015 | 32.989 |
| 2016 | 32.689 |
| 2017 | 32.963 |
| 2018 | 33.088 |
| 2019 | 33.763 |
| 2020 | 34.426 |
| 2021 | 34.956 |
| 2022 | 35.293 |
| 2023 | 35.989 |
| 2024 | 36.942 |
| 2025 | 38.06 |
| 2026 | 38.843 |
| 2027 | 39.092 |
| 2028 | 39.253 |
| 2029 | 39.118 |
| 2030 | 38.998 |
| 2031 | 38.932 |
| 2032 | 38.804 |
| 2033 | 38.292 |
| 2034 | 37.705 |
| 2035 | 37.225 |
| 2036 | 37.018 |
| 2037 | 37.022 |
| 2038 | 37.136 |
| 2039 | 37.205 |
| 2040 | 36.982 |
| 2041 | 36.374 |
| 2042 | 35.828 |
| 2043 | 35.597 |
| 2044 | 35.085 |
| 2045 | 34.345 |
| 2046 | 33.332 |
| 2047 | 32.034 |
| 2048 | 30.734 |
| 2049 | 29.465 |
| 2050 | 28.315 |
| 2051 | 27.928 |
| 2052 | 27.518 |
| 2053 | 26.944 |
| 2054 | 26.614 |
| 2055 | 26.405 |
| 2056 | 26.397 |
| 2057 | 26.893 |
| 2058 | 27.639 |
| 2059 | 28.624 |
| 2060 | 30.069 |
| 2061 | 31.105 |
| 2062 | 32.123 |
| 2063 | 32.931 |
| 2064 | 33.849 |
| 2065 | 34.778 |
| 2066 | 35.567 |
| 2067 | 35.993 |
| 2068 | 36.11 |
| 2069 | 36.164 |
| 2070 | 35.698 |
| 2071 | 35.239 |
| 2072 | 35.043 |
| 2073 | 35.356 |
| 2074 | 35.301 |
| 2075 | 34.955 |
| 2076 | 34.864 |
| 2077 | 34.863 |
| 2078 | 34.873 |
| 2079 | 34.727 |
| 2080 | 34.773 |
| 2081 | 34.766 |
| 2082 | 34.405 |
| 2083 | 33.844 |
| 2084 | 33.427 |
| 2085 | 33.448 |
| 2086 | 33.342 |
| 2087 | 33.197 |
| 2088 | 33.346 |
| 2089 | 33.592 |
| 2090 | 33.756 |
| 2091 | 34.059 |
| 2092 | 34.707 |
| 2093 | 35.152 |
| 2094 | 35.73 |
| 2095 | 36.09 |
| 2096 | 36.433 |
| 2097 | 37.083 |
| 2098 | 37.647 |
| 2099 | 38.209 |
| 2100 | 38.812 |
| 2101 | 39.121 |
| 2102 | 39.024 |
| 2103 | 38.991 |
| 2104 | 38.897 |
| 2105 | 38.845 |
| 2106 | 38.545 |
| 2107 | 37.727 |
| 2108 | 36.51 |
| 2109 | 35.082 |
| 2110 | 33.716 |
| 2111 | 32.767 |
| 2112 | 32.155 |
| 2113 | 31.628 |
| 2114 | 31.042 |
| 2115 | 30.362 |
| 2116 | 30.088 |
| 2117 | 30.177 |
| 2118 | 30.545 |
| 2119 | 31.189 |
| 2120 | 31.753 |
| 2121 | 32.108 |
| 2122 | 32.382 |
| 2123 | 32.639 |
| 2124 | 33.016 |
| 2125 | 33.754 |
| 2126 | 34.57 |
| 2127 | 35.203 |
| 2128 | 35.831 |
| 2129 | 36.36 |
| 2130 | 37.202 |
| 2131 | 38.163 |
| 2132 | 38.972 |
| 2133 | 39.686 |
| 2134 | 40.341 |
| 2135 | 40.628 |
| 2136 | 40.496 |
| 2137 | 40.929 |
| 2138 | 41.796 |
| 2139 | 42.917 |
| 2140 | 43.774 |
| 2141 | 44.903 |
| 2142 | 46.548 |
| 2143 | 48.854 |
| 2144 | 51.483 |
| 2145 | 54.57 |
| 2146 | 58.021 |
| 2147 | 60.824 |
| 2148 | 62.966 |
| 2149 | 64.871 |
| 2150 | 66.625 |
| 2151 | 67.835 |
| 2152 | 68.507 |
| 2153 | 68.459 |
| 2154 | 67.871 |
| 2155 | 66.736 |
| 2156 | 65.354 |
| 2157 | 63.985 |
| 2158 | 62.892 |
| 2159 | 61.679 |
| 2160 | 60.583 |
| 2161 | 59.316 |
| 2162 | 58.112 |
| 2163 | 57.077 |
| 2164 | 56.124 |
| 2165 | 55.299 |
| 2166 | 54.341 |
| 2167 | 53.603 |
| 2168 | 52.783 |
| 2169 | 52.2 |
| 2170 | 51.512 |
| 2171 | 51.275 |
| 2172 | 51.006 |
| 2173 | 50.514 |
| 2174 | 50.167 |
| 2175 | 49.747 |
| 2176 | 49.752 |
| 2177 | 49.725 |
| 2178 | 49.662 |
| 2179 | 49.249 |
| 2180 | 48.831 |
| 2181 | 48.176 |
| 2182 | 47.551 |
| 2183 | 47.159 |
| 2184 | 46.843 |
| 2185 | 46.727 |
| 2186 | 46.104 |
| 2187 | 45.37 |
| 2188 | 44.764 |
| 2189 | 44.147 |
| 2190 | 43.601 |
| 2191 | 43.198 |
| 2192 | 42.741 |
| 2193 | 42.351 |
| 2194 | 41.816 |
| 2195 | 41.145 |
| 2196 | 40.775 |
| 2197 | 40.606 |
| 2198 | 40.31 |
| 2199 | 40.526 |
| 2200 | 41.021 |
| 2201 | 41.585 |
| 2202 | 42.563 |
| 2203 | 43.443 |
| 2204 | 44.437 |
| 2205 | 45.651 |
| 2206 | 46.907 |
| 2207 | 47.983 |
| 2208 | 49.166 |
| 2209 | 49.955 |
| 2210 | 50.435 |
| 2211 | 50.878 |
| 2212 | 50.984 |
| 2213 | 51.147 |
| 2214 | 51.228 |
| 2215 | 50.935 |
| 2216 | 50.307 |
| 2217 | 49.657 |
| 2218 | 49.128 |
| 2219 | 48.799 |
| 2220 | 48.445 |
| 2221 | 48.095 |
| 2222 | 47.748 |
| 2223 | 47.247 |
| 2224 | 46.761 |
| 2225 | 46.771 |
| 2226 | 47.129 |
| 2227 | 47.562 |
| 2228 | 47.746 |
| 2229 | 47.737 |
| 2230 | 47.924 |
| 2231 | 47.817 |
| 2232 | 47.837 |
| 2233 | 48.027 |
| 2234 | 48.067 |
| 2235 | 47.605 |
| 2236 | 47.184 |
| 2237 | 46.705 |
| 2238 | 46.202 |
| 2239 | 45.84 |
| 2240 | 45.464 |
| 2241 | 45.568 |
| 2242 | 45.412 |
| 2243 | 45.179 |
| 2244 | 45.161 |
| 2245 | 45.524 |
| 2246 | 45.706 |
| 2247 | 45.993 |
| 2248 | 46.482 |
| 2249 | 47.109 |
| 2250 | 47.629 |
| 2251 | 47.611 |
| 2252 | 47.685 |
| 2253 | 47.76 |
| 2254 | 47.799 |
| 2255 | 47.508 |
| 2256 | 47.182 |
| 2257 | 46.812 |
| 2258 | 46.2 |
| 2259 | 45.429 |
| 2260 | 44.592 |
| 2261 | 44.454 |
| 2262 | 44.509 |
| 2263 | 44.581 |
| 2264 | 44.833 |
| 2265 | 45.361 |
| 2266 | 46.02 |
| 2267 | 46.619 |
| 2268 | 47.386 |
| 2269 | 48.13 |
| 2270 | 49.139 |
| 2271 | 49.48 |
| 2272 | 49.851 |
| 2273 | 50.262 |
| 2274 | 50.249 |
| 2275 | 50.16 |
| 2276 | 49.92 |
| 2277 | 49.619 |
| 2278 | 49.335 |
| 2279 | 49.118 |
| 2280 | 48.632 |
| 2281 | 48.42 |
| 2282 | 48.029 |
| 2283 | 47.276 |
| 2284 | 46.722 |
| 2285 | 46.145 |
| 2286 | 45.888 |
| 2287 | 45.846 |
| 2288 | 45.696 |
| 2289 | 45.04 |
| 2290 | 44.449 |
| 2291 | 43.962 |
| 2292 | 43.479 |
| 2293 | 43.522 |
| 2294 | 43.56 |
| 2295 | 43.487 |
| 2296 | 43.142 |
| 2297 | 42.692 |
| 2298 | 42.343 |
| 2299 | 42.644 |
| 2300 | 42.932 |
| 2301 | 42.993 |
| 2302 | 43.095 |
| 2303 | 43.11 |
| 2304 | 43.238 |
| 2305 | 43.521 |
| 2306 | 43.778 |
| 2307 | 44.032 |
| 2308 | 44.271 |
| 2309 | 44.489 |
| 2310 | 44.872 |
| 2311 | 45.411 |
| 2312 | 45.958 |
| 2313 | 46.389 |
| 2314 | 46.647 |
| 2315 | 46.798 |
| 2316 | 47.072 |
| 2317 | 47.321 |
| 2318 | 47.684 |
| 2319 | 47.625 |
| 2320 | 47.287 |
| 2321 | 46.999 |
| 2322 | 46.726 |
| 2323 | 46.326 |
| 2324 | 46.029 |
| 2325 | 45.728 |
| 2326 | 45.454 |
| 2327 | 45.227 |
| 2328 | 44.623 |
| 2329 | 44.393 |
| 2330 | 44.572 |
| 2331 | 44.706 |
| 2332 | 44.875 |
| 2333 | 45.188 |
| 2334 | 45.544 |
| 2335 | 46.171 |
| 2336 | 46.67 |
| 2337 | 47.034 |
| 2338 | 47.684 |
| 2339 | 48.486 |
| 2340 | 48.842 |
| 2341 | 49.037 |
| 2342 | 49.066 |
| 2343 | 49.093 |
| 2344 | 49.107 |
| 2345 | 48.924 |
| 2346 | 48.704 |
| 2347 | 48.733 |
| 2348 | 48.868 |
| 2349 | 48.405 |
| 2350 | 48.151 |
| 2351 | 48.035 |
| 2352 | 47.97 |
| 2353 | 47.915 |
| 2354 | 47.847 |
| 2355 | 47.621 |
| 2356 | 47.573 |
| 2357 | 47.34 |
| 2358 | 46.788 |
| 2359 | 46.579 |
| 2360 | 46.383 |
| 2361 | 46.228 |
| 2362 | 46.114 |
| 2363 | 45.864 |
| 2364 | 45.534 |
| 2365 | 45.281 |
| 2366 | 44.612 |
| 2367 | 43.697 |
| 2368 | 43.09 |
| 2369 | 42.557 |
| 2370 | 41.983 |
| 2371 | 41.308 |
| 2372 | 40.819 |
| 2373 | 40.472 |
| 2374 | 40.157 |
| 2375 | 40.014 |
| 2376 | 40.504 |
| 2377 | 41.701 |
| 2378 | 42.846 |
| 2379 | 43.911 |
| 2380 | 44.833 |
| 2381 | 45.75 |
| 2382 | 46.324 |
| 2383 | 46.784 |
| 2384 | 47.079 |
| 2385 | 47.208 |
| 2386 | 46.764 |
| 2387 | 45.784 |
| 2388 | 44.642 |
| 2389 | 43.444 |
| 2390 | 42.578 |
| 2391 | 41.76 |
| 2392 | 41.127 |
| 2393 | 40.467 |
| 2394 | 39.85 |
| 2395 | 39.446 |
| 2396 | 39.634 |
| 2397 | 40.103 |
| 2398 | 40.79 |
| 2399 | 41.449 |
| 2400 | 41.843 |
| 2401 | 42.183 |
| 2402 | 42.495 |
| 2403 | 42.704 |
| 2404 | 42.97 |
| 2405 | 43.028 |
| 2406 | 42.734 |
| 2407 | 42.2 |
| 2408 | 41.447 |
| 2409 | 40.701 |
| 2410 | 40.158 |
| 2411 | 39.632 |
| 2412 | 39.315 |
| 2413 | 39.603 |
| 2414 | 40.274 |
| 2415 | 41.061 |
| 2416 | 42.074 |
| 2417 | 43.264 |
| 2418 | 44.524 |
| 2419 | 45.878 |
| 2420 | 47.174 |
| 2421 | 48.595 |
| 2422 | 49.799 |
| 2423 | 50.582 |
| 2424 | 50.921 |
| 2425 | 51.211 |
| 2426 | 51.147 |
| 2427 | 50.891 |
| 2428 | 50.504 |
| 2429 | 49.99 |
| 2430 | 49.194 |
| 2431 | 48.342 |
| 2432 | 47.532 |
| 2433 | 46.613 |
| 2434 | 45.793 |
| 2435 | 45.02 |
| 2436 | 44.36 |
| 2437 | 43.855 |
| 2438 | 43.669 |
| 2439 | 43.802 |
| 2440 | 44.376 |
| 2441 | 45.109 |
| 2442 | 45.814 |
| 2443 | 46.842 |
| 2444 | 48.049 |
| 2445 | 49.082 |
| 2446 | 49.987 |
| 2447 | 50.789 |
| 2448 | 51.249 |
| 2449 | 51.35 |
| 2450 | 51.169 |
| 2451 | 50.489 |
| 2452 | 49.685 |
| 2453 | 48.587 |
| 2454 | 47.393 |
| 2455 | 46.274 |
| 2456 | 45.487 |
| 2457 | 44.667 |
| 2458 | 44.173 |
| 2459 | 43.833 |
| 2460 | 43.573 |
| 2461 | 43.372 |
| 2462 | 43.363 |
| 2463 | 43.609 |
| 2464 | 43.943 |
| 2465 | 44.325 |
| 2466 | 44.539 |
| 2467 | 44.841 |
| 2468 | 44.976 |
| 2469 | 45.226 |
| 2470 | 45.357 |
| 2471 | 45.906 |
| 2472 | 46.401 |
| 2473 | 46.657 |
| 2474 | 46.569 |
| 2475 | 46.59 |
| 2476 | 46.748 |
| 2477 | 46.96 |
| 2478 | 47.184 |
| 2479 | 47.164 |
| 2480 | 47.365 |
| 2481 | 47.446 |
| 2482 | 47.489 |
| 2483 | 47.828 |
| 2484 | 48.456 |
| 2485 | 48.983 |
| 2486 | 49.415 |
| 2487 | 49.802 |
| 2488 | 50.368 |
| 2489 | 50.934 |
| 2490 | 51.474 |
| 2491 | 52.038 |
| 2492 | 52.765 |
| 2493 | 53.075 |
| 2494 | 53.373 |
| 2495 | 53.733 |
| 2496 | 53.916 |
| 2497 | 54.127 |
| 2498 | 53.869 |
| 2499 | 53.886 |
| 2500 | 53.875 |
| 2501 | 53.808 |
| 2502 | 53.499 |
| 2503 | 53.465 |
| 2504 | 53.121 |
| 2505 | 52.531 |
| 2506 | 51.95 |
| 2507 | 51.342 |
| 2508 | 51.107 |
| 2509 | 50.512 |
| 2510 | 49.626 |
| 2511 | 48.624 |
| 2512 | 47.642 |
| 2513 | 46.373 |
| 2514 | 45.16 |
| 2515 | 44.071 |
| 2516 | 43.332 |
| 2517 | 42.512 |
| 2518 | 41.56 |
| 2519 | 40.726 |
| 2520 | 40.277 |
| 2521 | 39.946 |
| 2522 | 39.83 |
| 2523 | 40.147 |
| 2524 | 40.949 |
| 2525 | 42.054 |
| 2526 | 42.944 |
| 2527 | 43.826 |
| 2528 | 44.822 |
| 2529 | 46.004 |
| 2530 | 46.904 |
| 2531 | 47.911 |
| 2532 | 48.7 |
| 2533 | 49.138 |
| 2534 | 49.21 |
| 2535 | 48.904 |
| 2536 | 48.456 |
| 2537 | 48.106 |
| 2538 | 47.599 |
| 2539 | 46.862 |
| 2540 | 45.98 |
| 2541 | 44.709 |
| 2542 | 43.34 |
| 2543 | 42.221 |
| 2544 | 41.276 |
| 2545 | 40.275 |
| 2546 | 39.477 |
| 2547 | 38.678 |
| 2548 | 38.093 |
| 2549 | 37.755 |
| 2550 | 38.023 |
| 2551 | 38.764 |
| 2552 | 39.858 |
| 2553 | 40.709 |
| 2554 | 41.347 |
| 2555 | 42.409 |
| 2556 | 43.406 |
| 2557 | 44.444 |
| 2558 | 45.461 |
| 2559 | 46.354 |
| 2560 | 46.883 |
| 2561 | 46.979 |
| 2562 | 46.879 |
| 2563 | 47.052 |
| 2564 | 47.358 |
| 2565 | 47.557 |
| 2566 | 47.725 |
| 2567 | 47.917 |
| 2568 | 47.88 |
| 2569 | 47.857 |
| 2570 | 47.915 |
| 2571 | 48.41 |
| 2572 | 48.881 |
| 2573 | 49.106 |
| 2574 | 49.119 |
| 2575 | 48.885 |
| 2576 | 48.746 |
| 2577 | 48.344 |
| 2578 | 48.059 |
| 2579 | 47.618 |
| 2580 | 47.041 |
| 2581 | 46.123 |
| 2582 | 45.169 |
| 2583 | 44.158 |
| 2584 | 43.4 |
| 2585 | 42.756 |
| 2586 | 42.255 |
| 2587 | 41.929 |
| 2588 | 41.558 |
| 2589 | 41.319 |
| 2590 | 40.923 |
| 2591 | 40.672 |
| 2592 | 40.736 |
| 2593 | 41.114 |
| 2594 | 41.455 |
| 2595 | 41.782 |
| 2596 | 41.601 |
| 2597 | 41.379 |
| 2598 | 41.07 |
| 2599 | 40.589 |
| 2600 | 40.434 |
| 2601 | 40.318 |
| 2602 | 39.893 |
| 2603 | 39.359 |
| 2604 | 38.85 |
| 2605 | 38.304 |
| 2606 | 38.019 |
| 2607 | 37.927 |
| 2608 | 38.102 |
| 2609 | 38.738 |
| 2610 | 39.536 |
| 2611 | 40.237 |
| 2612 | 41.165 |
| 2613 | 41.88 |
| 2614 | 42.362 |
| 2615 | 42.832 |
| 2616 | 43.506 |
| 2617 | 43.949 |
| 2618 | 44.249 |
| 2619 | 44.118 |
| 2620 | 43.607 |
| 2621 | 43.019 |
| 2622 | 42.033 |
| 2623 | 41.519 |
| 2624 | 41.269 |
| 2625 | 41.111 |
| 2626 | 40.801 |
| 2627 | 40.629 |
| 2628 | 40.342 |
| 2629 | 40.279 |
| 2630 | 40.39 |
| 2631 | 40.451 |
| 2632 | 40.937 |
| 2633 | 40.992 |
| 2634 | 41.202 |
| 2635 | 41.351 |
| 2636 | 41.495 |
| 2637 | 41.534 |
| 2638 | 41.801 |
| 2639 | 42.061 |
| 2640 | 42.159 |
| 2641 | 42.691 |
| 2642 | 43.109 |
| 2643 | 43.694 |
| 2644 | 43.863 |
| 2645 | 44.018 |
| 2646 | 44.111 |
| 2647 | 44.284 |
| 2648 | 44.421 |
| 2649 | 44.443 |
| 2650 | 44.586 |
| 2651 | 44.677 |
| 2652 | 44.655 |
| 2653 | 44.611 |
| 2654 | 44.763 |
| 2655 | 44.889 |
| 2656 | 44.941 |
| 2657 | 44.852 |
| 2658 | 44.698 |
| 2659 | 44.403 |
| 2660 | 44.157 |
| 2661 | 43.163 |
| 2662 | 42.251 |
| 2663 | 41.226 |
| 2664 | 40.127 |
| 2665 | 39.278 |
| 2666 | 38.652 |
| 2667 | 38.138 |
| 2668 | 37.389 |
| 2669 | 36.907 |
| 2670 | 36.233 |
| 2671 | 36.249 |
| 2672 | 36.219 |
| 2673 | 36.263 |
| 2674 | 36.387 |
| 2675 | 36.261 |
| 2676 | 36.228 |
| 2677 | 36.302 |
| 2678 | 36.89 |
| 2679 | 37.435 |
| 2680 | 38.262 |
| 2681 | 39.077 |
| 2682 | 39.94 |
| 2683 | 40.906 |
| 2684 | 41.713 |
| 2685 | 42.607 |
| 2686 | 43.361 |
| 2687 | 44.187 |
| 2688 | 44.856 |
| 2689 | 45.57 |
| 2690 | 45.99 |
| 2691 | 46.17 |
| 2692 | 46.18 |
| 2693 | 45.977 |
| 2694 | 46.069 |
| 2695 | 46.225 |
| 2696 | 46.244 |
| 2697 | 45.954 |
| 2698 | 45.584 |
| 2699 | 45.244 |
| 2700 | 45.261 |
| 2701 | 45.637 |
| 2702 | 46.312 |
| 2703 | 47.313 |
| 2704 | 48.324 |
| 2705 | 49.348 |
| 2706 | 50.457 |
| 2707 | 51.503 |
| 2708 | 52.344 |
| 2709 | 52.946 |
| 2710 | 53.255 |
| 2711 | 53.17 |
| 2712 | 52.999 |
| 2713 | 52.632 |
| 2714 | 51.931 |
| 2715 | 51.214 |
| 2716 | 50.519 |
| 2717 | 50.028 |
| 2718 | 49.761 |
| 2719 | 49.38 |
| 2720 | 48.94 |
| 2721 | 48.692 |
| 2722 | 48.356 |
| 2723 | 47.799 |
| 2724 | 47.342 |
| 2725 | 46.673 |
| 2726 | 45.95 |
| 2727 | 45.342 |
| 2728 | 44.596 |
| 2729 | 44.252 |
| 2730 | 44.286 |
| 2731 | 44.25 |
| 2732 | 44.142 |
| 2733 | 44.427 |
| 2734 | 44.782 |
| 2735 | 45.309 |
| 2736 | 45.996 |
| 2737 | 46.468 |
| 2738 | 47.12 |
| 2739 | 47.598 |
| 2740 | 47.856 |
| 2741 | 48.029 |
| 2742 | 48.29 |
| 2743 | 48.422 |
| 2744 | 48.404 |
| 2745 | 48.352 |
| 2746 | 48.173 |
| 2747 | 47.958 |
| 2748 | 47.457 |
| 2749 | 47.022 |
| 2750 | 46.61 |
| 2751 | 46.33 |
| 2752 | 46.144 |
| 2753 | 45.903 |
| 2754 | 45.909 |
| 2755 | 45.518 |
| 2756 | 44.985 |
| 2757 | 44.758 |
| 2758 | 44.685 |
| 2759 | 44.568 |
| 2760 | 44.316 |
| 2761 | 43.744 |
| 2762 | 42.792 |
| 2763 | 41.642 |
| 2764 | 40.286 |
| 2765 | 39.418 |
| 2766 | 38.582 |
| 2767 | 37.28 |
| 2768 | 35.872 |
| 2769 | 34.472 |
| 2770 | 33.043 |
| 2771 | 31.696 |
| 2772 | 30.672 |
| 2773 | 29.933 |
| 2774 | 29.281 |
| 2775 | 28.418 |
| 2776 | 27.44 |
| 2777 | 26.774 |
| 2778 | 26.645 |
| 2779 | 26.414 |
| 2780 | 26.387 |
| 2781 | 26.871 |
| 2782 | 27.301 |
| 2783 | 27.56 |
| 2784 | 27.662 |
| 2785 | 27.694 |
| 2786 | 28.203 |
| 2787 | 28.832 |
| 2788 | 28.962 |
| 2789 | 28.969 |
| 2790 | 28.983 |
| 2791 | 28.773 |
| 2792 | 28.74 |
| 2793 | 28.695 |
| 2794 | 28.858 |
| 2795 | 29.646 |
| 2796 | 30.298 |
| 2797 | 30.803 |
| 2798 | 31.354 |
| 2799 | 32.166 |
| 2800 | 32.768 |
| 2801 | 33.062 |
| 2802 | 32.966 |
| 2803 | 33.421 |
| 2804 | 33.909 |
| 2805 | 33.855 |
| 2806 | 33.647 |
| 2807 | 33.286 |
| 2808 | 33.038 |
| 2809 | 32.818 |
| 2810 | 32.52 |
| 2811 | 32.782 |
| 2812 | 33.651 |
| 2813 | 33.904 |
| 2814 | 34.309 |
| 2815 | 34.75 |
| 2816 | 35.547 |
| 2817 | 36.619 |
| 2818 | 37.456 |
| 2819 | 38.175 |
| 2820 | 39.484 |
| 2821 | 40.282 |
| 2822 | 40.526 |
| 2823 | 40.988 |
| 2824 | 41.135 |
| 2825 | 41.896 |
| 2826 | 42.354 |
| 2827 | 42.892 |
| 2828 | 43.78 |
| 2829 | 44.805 |
| 2830 | 45.253 |
| 2831 | 45.836 |
| 2832 | 46.667 |
| 2833 | 47.501 |
| 2834 | 48.417 |
| 2835 | 48.207 |
| 2836 | 47.779 |
| 2837 | 46.951 |
| 2838 | 45.708 |
| 2839 | 44.406 |
| 2840 | 43.502 |
| 2841 | 42.588 |
| 2842 | 41.586 |
| 2843 | 40.448 |
| 2844 | 39.166 |
| 2845 | 38.661 |
| 2846 | 38.315 |
| 2847 | 38.193 |
| 2848 | 38.577 |
| 2849 | 38.758 |
| 2850 | 38.444 |
| 2851 | 38.344 |
| 2852 | 37.94 |
| 2853 | 37.443 |
| 2854 | 37.197 |
| 2855 | 36.657 |
| 2856 | 36.068 |
| 2857 | 35.266 |
| 2858 | 34.156 |
| 2859 | 33.329 |
| 2860 | 32.779 |
| 2861 | 32.052 |
| 2862 | 31.949 |
| 2863 | 32.131 |
| 2864 | 32.194 |
| 2865 | 32.258 |
| 2866 | 32.294 |
| 2867 | 32.563 |
| 2868 | 32.806 |
| 2869 | 32.986 |
| 2870 | 33.339 |
| 2871 | 33.559 |
| 2872 | 33.388 |
| 2873 | 33.178 |
| 2874 | 33.015 |
| 2875 | 32.934 |
| 2876 | 33.129 |
| 2877 | 33.42 |
| 2878 | 33.894 |
| 2879 | 34.162 |
| 2880 | 34.354 |
| 2881 | 34.817 |
| 2882 | 35.235 |
| 2883 | 35.56 |
| 2884 | 35.872 |
| 2885 | 36.379 |
| 2886 | 36.924 |
| 2887 | 37.085 |
| 2888 | 36.908 |
| 2889 | 36.729 |
| 2890 | 36.203 |
| 2891 | 35.44 |
| 2892 | 34.928 |
| 2893 | 34.416 |
| 2894 | 33.99 |
| 2895 | 33.256 |
| 2896 | 32.235 |
| 2897 | 31.536 |
| 2898 | 31.056 |
| 2899 | 30.785 |
| 2900 | 30.901 |
| 2901 | 31.005 |
| 2902 | 31.028 |
| 2903 | 31.053 |
| 2904 | 30.865 |
| 2905 | 30.857 |
| 2906 | 31.027 |
| 2907 | 31.022 |
| 2908 | 30.94 |
| 2909 | 30.97 |
| 2910 | 30.984 |
| 2911 | 31.328 |
| 2912 | 31.701 |
| 2913 | 32.198 |
| 2914 | 32.773 |
| 2915 | 33.119 |
| 2916 | 33.451 |
| 2917 | 34.013 |
| 2918 | 34.878 |
| 2919 | 35.48 |
| 2920 | 35.757 |
| 2921 | 35.872 |
| 2922 | 36.026 |
| 2923 | 36.16 |
| 2924 | 36.461 |
| 2925 | 37.15 |
| 2926 | 37.596 |
| 2927 | 37.902 |
| 2928 | 37.967 |
| 2929 | 37.94 |
| 2930 | 38.274 |
| 2931 | 38.701 |
| 2932 | 38.654 |
| 2933 | 38.39 |
| 2934 | 38.002 |
| 2935 | 37.323 |
| 2936 | 36.765 |
| 2937 | 36.143 |
| 2938 | 35.438 |
| 2939 | 35.035 |
| 2940 | 34.398 |
| 2941 | 33.239 |
| 2942 | 32.43 |
| 2943 | 31.695 |
| 2944 | 30.901 |
| 2945 | 30.033 |
| 2946 | 29.443 |
| 2947 | 28.922 |
| 2948 | 28.643 |
| 2949 | 28.198 |
| 2950 | 27.788 |
| 2951 | 27.902 |
| 2952 | 28.227 |
| 2953 | 28.771 |
| 2954 | 29.292 |
| 2955 | 29.951 |
| 2956 | 30.341 |
| 2957 | 30.757 |
| 2958 | 31.116 |
| 2959 | 31.681 |
| 2960 | 32.485 |
| 2961 | 33.112 |
| 2962 | 33.755 |
| 2963 | 34.406 |
| 2964 | 35.36 |
| 2965 | 36.506 |
| 2966 | 37.641 |
| 2967 | 38.574 |
| 2968 | 39.183 |
| 2969 | 39.438 |
| 2970 | 39.385 |
| 2971 | 39.336 |
| 2972 | 38.766 |
| 2973 | 38.021 |
| 2974 | 36.906 |
| 2975 | 35.665 |
| 2976 | 34.678 |
| 2977 | 34.097 |
| 2978 | 33.914 |
| 2979 | 34.006 |
| 2980 | 34.405 |
| 2981 | 34.979 |
| 2982 | 35.979 |
| 2983 | 36.695 |
| 2984 | 37.414 |
| 2985 | 37.831 |
| 2986 | 38.037 |
| 2987 | 37.864 |
| 2988 | 37.634 |
| 2989 | 37.284 |
| 2990 | 36.688 |
| 2991 | 35.887 |
| 2992 | 34.689 |
| 2993 | 33.804 |
| 2994 | 33.185 |
| 2995 | 32.721 |
| 2996 | 32.286 |
| 2997 | 32.103 |
| 2998 | 31.803 |
| 2999 | 31.723 |
| 3000 | 31.569 |
| 3001 | 31.574 |
| 3002 | 32.203 |
| 3003 | 32.926 |
| 3004 | 33.607 |
| 3005 | 34.509 |
| 3006 | 35.369 |
| 3007 | 35.956 |
| 3008 | 36.605 |
| 3009 | 37.094 |
| 3010 | 37.854 |
| 3011 | 38.419 |
| 3012 | 38.465 |
| 3013 | 38.337 |
| 3014 | 38.204 |
| 3015 | 37.798 |
| 3016 | 37.357 |
| 3017 | 37.189 |
| 3018 | 36.884 |
| 3019 | 36.393 |
| 3020 | 35.719 |
| 3021 | 35.205 |
| 3022 | 34.938 |
| 3023 | 35.033 |
| 3024 | 34.868 |
| 3025 | 35.12 |
| 3026 | 35.467 |
| 3027 | 35.86 |
| 3028 | 36.378 |
| 3029 | 37.173 |
| 3030 | 37.896 |
| 3031 | 38.842 |
| 3032 | 39.525 |
| 3033 | 39.793 |
| 3034 | 40.406 |
| 3035 | 40.737 |
| 3036 | 40.927 |
| 3037 | 40.708 |
| 3038 | 40.438 |
| 3039 | 39.972 |
| 3040 | 39.756 |
| 3041 | 38.985 |
| 3042 | 38.46 |
| 3043 | 37.928 |
| 3044 | 37.237 |
| 3045 | 36.588 |
| 3046 | 36.213 |
| 3047 | 36.094 |
| 3048 | 35.92 |
| 3049 | 35.694 |
| 3050 | 35.288 |
| 3051 | 35.083 |
| 3052 | 34.98 |
| 3053 | 34.948 |
| 3054 | 34.739 |
| 3055 | 34.195 |
| 3056 | 33.4 |
| 3057 | 32.596 |
| 3058 | 31.934 |
| 3059 | 31.466 |
| 3060 | 30.828 |
| 3061 | 30.184 |
| 3062 | 29.449 |
| 3063 | 28.931 |
| 3064 | 28.504 |
| 3065 | 28.588 |
| 3066 | 29.069 |
| 3067 | 29.547 |
| 3068 | 29.681 |
| 3069 | 29.737 |
| 3070 | 30.034 |
| 3071 | 30.305 |
| 3072 | 30.33 |
| 3073 | 30.191 |
| 3074 | 30.254 |
| 3075 | 29.969 |
| 3076 | 28.967 |
| 3077 | 28.028 |
| 3078 | 27.73 |
| 3079 | 27.474 |
| 3080 | 27.262 |
| 3081 | 27.252 |
| 3082 | 27.358 |
| 3083 | 27.389 |
| 3084 | 27.474 |
| 3085 | 28.026 |
| 3086 | 29.292 |
| 3087 | 30.577 |
| 3088 | 31.502 |
| 3089 | 32.361 |
| 3090 | 33.189 |
| 3091 | 33.913 |
| 3092 | 34.901 |
| 3093 | 35.975 |
| 3094 | 36.737 |
| 3095 | 36.81 |
| 3096 | 36.311 |
| 3097 | 35.792 |
| 3098 | 35.218 |
| 3099 | 34.652 |
| 3100 | 34.079 |
| 3101 | 33.72 |
| 3102 | 33.179 |
| 3103 | 32.605 |
| 3104 | 32.076 |
| 3105 | 32.114 |
| 3106 | 32.501 |
| 3107 | 32.579 |
| 3108 | 32.518 |
| 3109 | 32.493 |
| 3110 | 32.52 |
| 3111 | 32.315 |
| 3112 | 32.097 |
| 3113 | 32.05 |
| 3114 | 32.146 |
| 3115 | 31.949 |
| 3116 | 31.762 |
| 3117 | 31.98 |
| 3118 | 32.641 |
| 3119 | 33.396 |
| 3120 | 34.114 |
| 3121 | 34.892 |
| 3122 | 35.515 |
| 3123 | 36.051 |
| 3124 | 36.713 |
| 3125 | 37.474 |
| 3126 | 38.162 |
| 3127 | 38.58 |
| 3128 | 38.433 |
| 3129 | 38.197 |
| 3130 | 37.927 |
| 3131 | 37.657 |
| 3132 | 37.611 |
| 3133 | 37.33 |
| 3134 | 36.778 |
| 3135 | 36.176 |
| 3136 | 35.398 |
| 3137 | 34.789 |
| 3138 | 34.825 |
| 3139 | 34.838 |
| 3140 | 34.839 |
| 3141 | 34.639 |
| 3142 | 34.353 |
| 3143 | 34.174 |
| 3144 | 33.964 |
| 3145 | 33.719 |
| 3146 | 33.826 |
| 3147 | 34.046 |
| 3148 | 33.911 |
| 3149 | 33.745 |
| 3150 | 33.503 |
| 3151 | 33.549 |
| 3152 | 33.688 |
| 3153 | 34.011 |
| 3154 | 35.018 |
| 3155 | 36.062 |
| 3156 | 36.861 |
| 3157 | 37.396 |
| 3158 | 37.61 |
| 3159 | 37.915 |
| 3160 | 38.3 |
| 3161 | 38.564 |
| 3162 | 38.482 |
| 3163 | 38.239 |
| 3164 | 37.031 |
| 3165 | 35.961 |
| 3166 | 35.013 |
| 3167 | 34.215 |
| 3168 | 33.964 |
| 3169 | 33.588 |
| 3170 | 33.165 |
| 3171 | 32.63 |
| 3172 | 32.578 |
| 3173 | 32.62 |
| 3174 | 33.256 |
| 3175 | 33.701 |
| 3176 | 33.867 |
| 3177 | 33.987 |
| 3178 | 33.852 |
| 3179 | 33.802 |
| 3180 | 33.955 |
| 3181 | 34.132 |
| 3182 | 33.877 |
| 3183 | 33.32 |
| 3184 | 32.133 |
| 3185 | 31.136 |
| 3186 | 30.337 |
| 3187 | 29.467 |
| 3188 | 28.842 |
| 3189 | 28.325 |
| 3190 | 27.563 |
| 3191 | 26.915 |
| 3192 | 26.606 |
| 3193 | 26.898 |
| 3194 | 27.898 |
| 3195 | 28.844 |
| 3196 | 30.027 |
| 3197 | 31.211 |
| 3198 | 32.2 |
| 3199 | 32.842 |
| 3200 | 33.272 |
| 3201 | 33.764 |
| 3202 | 34.13 |
| 3203 | 33.902 |
| 3204 | 33.303 |
| 3205 | 32.636 |
| 3206 | 31.756 |
| 3207 | 31.062 |
| 3208 | 30.298 |
| 3209 | 29.856 |
| 3210 | 29.922 |
| 3211 | 29.992 |
| 3212 | 29.958 |
| 3213 | 30.335 |
| 3214 | 30.926 |
| 3215 | 31.26 |
| 3216 | 31.401 |
| 3217 | 31.419 |
| 3218 | 31.467 |
| 3219 | 31.337 |
| 3220 | 31.108 |
| 3221 | 30.6 |
| 3222 | 30.176 |
| 3223 | 29.393 |
| 3224 | 28.31 |
| 3225 | 27.613 |
| 3226 | 27.155 |
| 3227 | 26.636 |
| 3228 | 26.228 |
| 3229 | 26.109 |
| 3230 | 25.973 |
| 3231 | 26.147 |
| 3232 | 26.47 |
| 3233 | 27.14 |
| 3234 | 28.161 |
| 3235 | 29.067 |
| 3236 | 30.023 |
| 3237 | 31.094 |
| 3238 | 32.277 |
| 3239 | 33.322 |
| 3240 | 33.97 |
| 3241 | 34.393 |
| 3242 | 34.544 |
| 3243 | 34.525 |
| 3244 | 34.283 |
| 3245 | 34.047 |
| 3246 | 33.568 |
| 3247 | 33.063 |
| 3248 | 32.318 |
| 3249 | 31.534 |
| 3250 | 31.301 |
| 3251 | 31.338 |
| 3252 | 31.83 |
| 3253 | 32.479 |
| 3254 | 33.326 |
| 3255 | 34.18 |
| 3256 | 35.203 |
| 3257 | 36.25 |
| 3258 | 37.383 |
| 3259 | 38.303 |
| 3260 | 38.849 |
| 3261 | 39.24 |
| 3262 | 39.138 |
| 3263 | 38.684 |
| 3264 | 38.113 |
| 3265 | 37.712 |
| 3266 | 37.61 |
| 3267 | 37.408 |
| 3268 | 36.906 |
| 3269 | 36.688 |
| 3270 | 36.803 |
| 3271 | 36.758 |
| 3272 | 36.648 |
| 3273 | 36.623 |
| 3274 | 36.429 |
| 3275 | 35.87 |
| 3276 | 34.737 |
| 3277 | 33.779 |
| 3278 | 33.414 |
| 3279 | 32.983 |
| 3280 | 32.324 |
| 3281 | 31.978 |
| 3282 | 32.236 |
| 3283 | 33.117 |
| 3284 | 34.168 |
| 3285 | 35.288 |
| 3286 | 36.494 |
| 3287 | 37.604 |
| 3288 | 38.328 |
| 3289 | 39 |
| 3290 | 39.665 |
| 3291 | 40.135 |
| 3292 | 40.358 |
| 3293 | 40.071 |
| 3294 | 39.816 |
| 3295 | 39.722 |
| 3296 | 39.902 |
| 3297 | 39.897 |
| 3298 | 39.884 |
| 3299 | 39.857 |
| 3300 | 39.88 |
| 3301 | 39.846 |
| 3302 | 39.443 |
| 3303 | 39.012 |
| 3304 | 38.468 |
| 3305 | 38.054 |
| 3306 | 37.55 |
| 3307 | 37.282 |
| 3308 | 37.08 |
| 3309 | 36.835 |
| 3310 | 36.402 |
| 3311 | 36.217 |
| 3312 | 36.258 |
| 3313 | 35.874 |
| 3314 | 35.559 |
| 3315 | 34.97 |
| 3316 | 34.423 |
| 3317 | 33.893 |
| 3318 | 33.413 |
| 3319 | 33.385 |
| 3320 | 34.123 |
| 3321 | 34.715 |
| 3322 | 35.334 |
| 3323 | 36.838 |
| 3324 | 38.442 |
| 3325 | 40.098 |
| 3326 | 41.7 |
| 3327 | 43.142 |
| 3328 | 44.341 |
| 3329 | 44.775 |
| 3330 | 44.144 |
| 3331 | 43.451 |
| 3332 | 42.795 |
| 3333 | 41.644 |
| 3334 | 40.323 |
| 3335 | 39.166 |
| 3336 | 37.817 |
| 3337 | 36.423 |
| 3338 | 35.578 |
| 3339 | 35.142 |
| 3340 | 35.134 |
| 3341 | 34.975 |
| 3342 | 34.727 |
| 3343 | 34.745 |
| 3344 | 34.971 |
| 3345 | 35.064 |
| 3346 | 35.46 |
| 3347 | 36.134 |
| 3348 | 36.255 |
| 3349 | 36.395 |
| 3350 | 36.587 |
| 3351 | 36.957 |
| 3352 | 37.336 |
| 3353 | 37.316 |
| 3354 | 37.039 |
| 3355 | 36.847 |
| 3356 | 36.49 |
| 3357 | 35.852 |
| 3358 | 35.534 |
| 3359 | 35.224 |
| 3360 | 34.787 |
| 3361 | 34.436 |
| 3362 | 34.44 |
| 3363 | 34.725 |
| 3364 | 35.005 |
| 3365 | 35.03 |
| 3366 | 35.089 |
| 3367 | 35.259 |
| 3368 | 35.086 |
| 3369 | 34.681 |
| 3370 | 34.394 |
| 3371 | 33.988 |
| 3372 | 32.887 |
| 3373 | 31.635 |
| 3374 | 30.574 |
| 3375 | 29.848 |
| 3376 | 29.043 |
| 3377 | 28.302 |
| 3378 | 28.108 |
| 3379 | 28.104 |
| 3380 | 28.021 |
| 3381 | 28.064 |
| 3382 | 28.524 |
| 3383 | 29.056 |
| 3384 | 29.541 |
| 3385 | 29.894 |
| 3386 | 30.531 |
| 3387 | 31.04 |
| 3388 | 31.15 |
| 3389 | 31.405 |
| 3390 | 32.001 |
| 3391 | 32.661 |
| 3392 | 33.535 |
| 3393 | 34.55 |
| 3394 | 35.533 |
| 3395 | 36.343 |
| 3396 | 36.926 |
| 3397 | 37.642 |
| 3398 | 38.18 |
| 3399 | 38.263 |
| 3400 | 37.944 |
| 3401 | 37.576 |
| 3402 | 36.809 |
| 3403 | 35.814 |
| 3404 | 35.015 |
| 3405 | 34.72 |
| 3406 | 34.405 |
| 3407 | 34.012 |
| 3408 | 34.235 |
| 3409 | 34.943 |
| 3410 | 35.785 |
| 3411 | 36.3 |
| 3412 | 37.076 |
| 3413 | 37.997 |
| 3414 | 38.648 |
| 3415 | 38.768 |
| 3416 | 38.9 |
| 3417 | 39.031 |
| 3418 | 38.642 |
| 3419 | 38.189 |
| 3420 | 37.773 |
| 3421 | 37.554 |
| 3422 | 37.168 |
| 3423 | 36.458 |
| 3424 | 35.804 |
| 3425 | 35.305 |
| 3426 | 34.932 |
| 3427 | 34.478 |
| 3428 | 33.924 |
| 3429 | 33.114 |
| 3430 | 32.341 |
| 3431 | 31.799 |
| 3432 | 31.304 |
| 3433 | 31.297 |
| 3434 | 31.434 |
| 3435 | 31.629 |
| 3436 | 31.716 |
| 3437 | 31.992 |
| 3438 | 32.817 |
| 3439 | 33.874 |
| 3440 | 34.891 |
| 3441 | 35.681 |
| 3442 | 36.549 |
| 3443 | 37.153 |
| 3444 | 37.282 |
| 3445 | 36.996 |
| 3446 | 36.712 |
| 3447 | 36.155 |
| 3448 | 35.332 |
| 3449 | 34.247 |
| 3450 | 33.021 |
| 3451 | 31.8 |
| 3452 | 30.27 |
| 3453 | 28.737 |
| 3454 | 27.733 |
| 3455 | 27.406 |
| 3456 | 26.944 |
| 3457 | 26.863 |
| 3458 | 26.872 |
| 3459 | 27.202 |
| 3460 | 27.732 |
| 3461 | 28.34 |
| 3462 | 29.417 |
| 3463 | 30.811 |
| 3464 | 32.12 |
| 3465 | 32.961 |
| 3466 | 34.083 |
| 3467 | 35.144 |
| 3468 | 36.046 |
| 3469 | 37.008 |
| 3470 | 37.809 |
| 3471 | 38.562 |
| 3472 | 38.798 |
| 3473 | 38.502 |
| 3474 | 38.103 |
| 3475 | 38.205 |
| 3476 | 38.394 |
| 3477 | 38.375 |
| 3478 | 38.352 |
| 3479 | 37.918 |
| 3480 | 37.513 |
| 3481 | 37.12 |
| 3482 | 37.49 |
| 3483 | 38.426 |
| 3484 | 39.499 |
| 3485 | 40.176 |
| 3486 | 40.411 |
| 3487 | 40.792 |
| 3488 | 41.358 |
| 3489 | 41.982 |
| 3490 | 42.707 |
| 3491 | 43.28 |
| 3492 | 43.047 |
| 3493 | 42.338 |
| 3494 | 41.299 |
| 3495 | 40.447 |
| 3496 | 39.931 |
| 3497 | 39.405 |
| 3498 | 38.899 |
| 3499 | 38.964 |
| 3500 | 39.122 |
| 3501 | 39.456 |
| 3502 | 40.187 |
| 3503 | 41.092 |
| 3504 | 42.446 |
| 3505 | 43.611 |
| 3506 | 44.568 |
| 3507 | 45.322 |
| 3508 | 45.84 |
| 3509 | 45.708 |
| 3510 | 45.455 |
| 3511 | 45.288 |
| 3512 | 45.248 |
| 3513 | 45.306 |
| 3514 | 44.978 |
| 3515 | 44.466 |